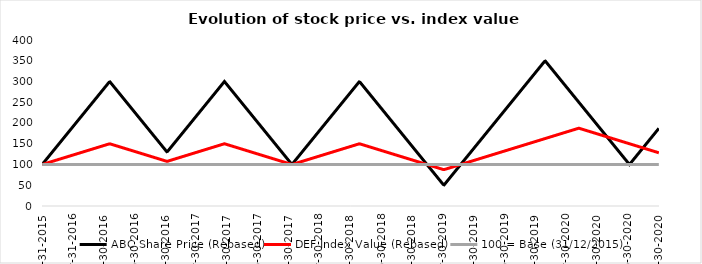
| Category | ABC Share Price (Rebased) | DEF Index Value (Rebased) | 100 = Base (31/12/2015) |
|---|---|---|---|
| 2020-12-31 | 187 | 128.25 | 100 |
| 2020-12-30 | 186 | 128.5 | 100 |
| 2020-12-29 | 185 | 128.75 | 100 |
| 2020-12-28 | 184 | 129 | 100 |
| 2020-12-27 | 183 | 129.25 | 100 |
| 2020-12-26 | 182 | 129.5 | 100 |
| 2020-12-25 | 181 | 129.75 | 100 |
| 2020-12-24 | 180 | 130 | 100 |
| 2020-12-23 | 179 | 130.25 | 100 |
| 2020-12-22 | 178 | 130.5 | 100 |
| 2020-12-21 | 177 | 130.75 | 100 |
| 2020-12-20 | 176 | 131 | 100 |
| 2020-12-19 | 175 | 131.25 | 100 |
| 2020-12-18 | 174 | 131.5 | 100 |
| 2020-12-17 | 173 | 131.75 | 100 |
| 2020-12-16 | 172 | 132 | 100 |
| 2020-12-15 | 171 | 132.25 | 100 |
| 2020-12-14 | 170 | 132.5 | 100 |
| 2020-12-13 | 169 | 132.75 | 100 |
| 2020-12-12 | 168 | 133 | 100 |
| 2020-12-11 | 167 | 133.25 | 100 |
| 2020-12-10 | 166 | 133.5 | 100 |
| 2020-12-09 | 165 | 133.75 | 100 |
| 2020-12-08 | 164 | 134 | 100 |
| 2020-12-07 | 163 | 134.25 | 100 |
| 2020-12-06 | 162 | 134.5 | 100 |
| 2020-12-05 | 161 | 134.75 | 100 |
| 2020-12-04 | 160 | 135 | 100 |
| 2020-12-03 | 159 | 135.25 | 100 |
| 2020-12-02 | 158 | 135.5 | 100 |
| 2020-12-01 | 157 | 135.75 | 100 |
| 2020-11-30 | 156 | 136 | 100 |
| 2020-11-29 | 155 | 136.25 | 100 |
| 2020-11-28 | 154 | 136.5 | 100 |
| 2020-11-27 | 153 | 136.75 | 100 |
| 2020-11-26 | 152 | 137 | 100 |
| 2020-11-25 | 151 | 137.25 | 100 |
| 2020-11-24 | 150 | 137.5 | 100 |
| 2020-11-23 | 149 | 137.75 | 100 |
| 2020-11-22 | 148 | 138 | 100 |
| 2020-11-21 | 147 | 138.25 | 100 |
| 2020-11-20 | 146 | 138.5 | 100 |
| 2020-11-19 | 145 | 138.75 | 100 |
| 2020-11-18 | 144 | 139 | 100 |
| 2020-11-17 | 143 | 139.25 | 100 |
| 2020-11-16 | 142 | 139.5 | 100 |
| 2020-11-15 | 141 | 139.75 | 100 |
| 2020-11-14 | 140 | 140 | 100 |
| 2020-11-13 | 139 | 140.25 | 100 |
| 2020-11-12 | 138 | 140.5 | 100 |
| 2020-11-11 | 137 | 140.75 | 100 |
| 2020-11-10 | 136 | 141 | 100 |
| 2020-11-09 | 135 | 141.25 | 100 |
| 2020-11-08 | 134 | 141.5 | 100 |
| 2020-11-07 | 133 | 141.75 | 100 |
| 2020-11-06 | 132 | 142 | 100 |
| 2020-11-05 | 131 | 142.25 | 100 |
| 2020-11-04 | 130 | 142.5 | 100 |
| 2020-11-03 | 129 | 142.75 | 100 |
| 2020-11-02 | 128 | 143 | 100 |
| 2020-11-01 | 127 | 143.25 | 100 |
| 2020-10-31 | 126 | 143.5 | 100 |
| 2020-10-30 | 125 | 143.75 | 100 |
| 2020-10-29 | 124 | 144 | 100 |
| 2020-10-28 | 123 | 144.25 | 100 |
| 2020-10-27 | 122 | 144.5 | 100 |
| 2020-10-26 | 121 | 144.75 | 100 |
| 2020-10-25 | 120 | 145 | 100 |
| 2020-10-24 | 119 | 145.25 | 100 |
| 2020-10-23 | 118 | 145.5 | 100 |
| 2020-10-22 | 117 | 145.75 | 100 |
| 2020-10-21 | 116 | 146 | 100 |
| 2020-10-20 | 115 | 146.25 | 100 |
| 2020-10-19 | 114 | 146.5 | 100 |
| 2020-10-18 | 113 | 146.75 | 100 |
| 2020-10-17 | 112 | 147 | 100 |
| 2020-10-16 | 111 | 147.25 | 100 |
| 2020-10-15 | 110 | 147.5 | 100 |
| 2020-10-14 | 109 | 147.75 | 100 |
| 2020-10-13 | 108 | 148 | 100 |
| 2020-10-12 | 107 | 148.25 | 100 |
| 2020-10-11 | 106 | 148.5 | 100 |
| 2020-10-10 | 105 | 148.75 | 100 |
| 2020-10-09 | 104 | 149 | 100 |
| 2020-10-08 | 103 | 149.25 | 100 |
| 2020-10-07 | 102 | 149.5 | 100 |
| 2020-10-06 | 101 | 149.75 | 100 |
| 2020-10-05 | 100 | 150 | 100 |
| 2020-10-04 | 101 | 150.25 | 100 |
| 2020-10-03 | 102 | 150.5 | 100 |
| 2020-10-02 | 103 | 150.75 | 100 |
| 2020-10-01 | 104 | 151 | 100 |
| 2020-09-30 | 105 | 151.25 | 100 |
| 2020-09-29 | 106 | 151.5 | 100 |
| 2020-09-28 | 107 | 151.75 | 100 |
| 2020-09-27 | 108 | 152 | 100 |
| 2020-09-26 | 109 | 152.25 | 100 |
| 2020-09-25 | 110 | 152.5 | 100 |
| 2020-09-24 | 111 | 152.75 | 100 |
| 2020-09-23 | 112 | 153 | 100 |
| 2020-09-22 | 113 | 153.25 | 100 |
| 2020-09-21 | 114 | 153.5 | 100 |
| 2020-09-20 | 115 | 153.75 | 100 |
| 2020-09-19 | 116 | 154 | 100 |
| 2020-09-18 | 117 | 154.25 | 100 |
| 2020-09-17 | 118 | 154.5 | 100 |
| 2020-09-16 | 119 | 154.75 | 100 |
| 2020-09-15 | 120 | 155 | 100 |
| 2020-09-14 | 121 | 155.25 | 100 |
| 2020-09-13 | 122 | 155.5 | 100 |
| 2020-09-12 | 123 | 155.75 | 100 |
| 2020-09-11 | 124 | 156 | 100 |
| 2020-09-10 | 125 | 156.25 | 100 |
| 2020-09-09 | 126 | 156.5 | 100 |
| 2020-09-08 | 127 | 156.75 | 100 |
| 2020-09-07 | 128 | 157 | 100 |
| 2020-09-06 | 129 | 157.25 | 100 |
| 2020-09-05 | 130 | 157.5 | 100 |
| 2020-09-04 | 131 | 157.75 | 100 |
| 2020-09-03 | 132 | 158 | 100 |
| 2020-09-02 | 133 | 158.25 | 100 |
| 2020-09-01 | 134 | 158.5 | 100 |
| 2020-08-31 | 135 | 158.75 | 100 |
| 2020-08-30 | 136 | 159 | 100 |
| 2020-08-29 | 137 | 159.25 | 100 |
| 2020-08-28 | 138 | 159.5 | 100 |
| 2020-08-27 | 139 | 159.75 | 100 |
| 2020-08-26 | 140 | 160 | 100 |
| 2020-08-25 | 141 | 160.25 | 100 |
| 2020-08-24 | 142 | 160.5 | 100 |
| 2020-08-23 | 143 | 160.75 | 100 |
| 2020-08-22 | 144 | 161 | 100 |
| 2020-08-21 | 145 | 161.25 | 100 |
| 2020-08-20 | 146 | 161.5 | 100 |
| 2020-08-19 | 147 | 161.75 | 100 |
| 2020-08-18 | 148 | 162 | 100 |
| 2020-08-17 | 149 | 162.25 | 100 |
| 2020-08-16 | 150 | 162.5 | 100 |
| 2020-08-15 | 151 | 162.75 | 100 |
| 2020-08-14 | 152 | 163 | 100 |
| 2020-08-13 | 153 | 163.25 | 100 |
| 2020-08-12 | 154 | 163.5 | 100 |
| 2020-08-11 | 155 | 163.75 | 100 |
| 2020-08-10 | 156 | 164 | 100 |
| 2020-08-09 | 157 | 164.25 | 100 |
| 2020-08-08 | 158 | 164.5 | 100 |
| 2020-08-07 | 159 | 164.75 | 100 |
| 2020-08-06 | 160 | 165 | 100 |
| 2020-08-05 | 161 | 165.25 | 100 |
| 2020-08-04 | 162 | 165.5 | 100 |
| 2020-08-03 | 163 | 165.75 | 100 |
| 2020-08-02 | 164 | 166 | 100 |
| 2020-08-01 | 165 | 166.25 | 100 |
| 2020-07-31 | 166 | 166.5 | 100 |
| 2020-07-30 | 167 | 166.75 | 100 |
| 2020-07-29 | 168 | 167 | 100 |
| 2020-07-28 | 169 | 167.25 | 100 |
| 2020-07-27 | 170 | 167.5 | 100 |
| 2020-07-26 | 171 | 167.75 | 100 |
| 2020-07-25 | 172 | 168 | 100 |
| 2020-07-24 | 173 | 168.25 | 100 |
| 2020-07-23 | 174 | 168.5 | 100 |
| 2020-07-22 | 175 | 168.75 | 100 |
| 2020-07-21 | 176 | 169 | 100 |
| 2020-07-20 | 177 | 169.25 | 100 |
| 2020-07-19 | 178 | 169.5 | 100 |
| 2020-07-18 | 179 | 169.75 | 100 |
| 2020-07-17 | 180 | 170 | 100 |
| 2020-07-16 | 181 | 170.25 | 100 |
| 2020-07-15 | 182 | 170.5 | 100 |
| 2020-07-14 | 183 | 170.75 | 100 |
| 2020-07-13 | 184 | 171 | 100 |
| 2020-07-12 | 185 | 171.25 | 100 |
| 2020-07-11 | 186 | 171.5 | 100 |
| 2020-07-10 | 187 | 171.75 | 100 |
| 2020-07-09 | 188 | 172 | 100 |
| 2020-07-08 | 189 | 172.25 | 100 |
| 2020-07-07 | 190 | 172.5 | 100 |
| 2020-07-06 | 191 | 172.75 | 100 |
| 2020-07-05 | 192 | 173 | 100 |
| 2020-07-04 | 193 | 173.25 | 100 |
| 2020-07-03 | 194 | 173.5 | 100 |
| 2020-07-02 | 195 | 173.75 | 100 |
| 2020-07-01 | 196 | 174 | 100 |
| 2020-06-30 | 197 | 174.25 | 100 |
| 2020-06-29 | 198 | 174.5 | 100 |
| 2020-06-28 | 199 | 174.75 | 100 |
| 2020-06-27 | 200 | 175 | 100 |
| 2020-06-26 | 201 | 175.25 | 100 |
| 2020-06-25 | 202 | 175.5 | 100 |
| 2020-06-24 | 203 | 175.75 | 100 |
| 2020-06-23 | 204 | 176 | 100 |
| 2020-06-22 | 205 | 176.25 | 100 |
| 2020-06-21 | 206 | 176.5 | 100 |
| 2020-06-20 | 207 | 176.75 | 100 |
| 2020-06-19 | 208 | 177 | 100 |
| 2020-06-18 | 209 | 177.25 | 100 |
| 2020-06-17 | 210 | 177.5 | 100 |
| 2020-06-16 | 211 | 177.75 | 100 |
| 2020-06-15 | 212 | 178 | 100 |
| 2020-06-14 | 213 | 178.25 | 100 |
| 2020-06-13 | 214 | 178.5 | 100 |
| 2020-06-12 | 215 | 178.75 | 100 |
| 2020-06-11 | 216 | 179 | 100 |
| 2020-06-10 | 217 | 179.25 | 100 |
| 2020-06-09 | 218 | 179.5 | 100 |
| 2020-06-08 | 219 | 179.75 | 100 |
| 2020-06-07 | 220 | 180 | 100 |
| 2020-06-06 | 221 | 180.25 | 100 |
| 2020-06-05 | 222 | 180.5 | 100 |
| 2020-06-04 | 223 | 180.75 | 100 |
| 2020-06-03 | 224 | 181 | 100 |
| 2020-06-02 | 225 | 181.25 | 100 |
| 2020-06-01 | 226 | 181.5 | 100 |
| 2020-05-31 | 227 | 181.75 | 100 |
| 2020-05-30 | 228 | 182 | 100 |
| 2020-05-29 | 229 | 182.25 | 100 |
| 2020-05-28 | 230 | 182.5 | 100 |
| 2020-05-27 | 231 | 182.75 | 100 |
| 2020-05-26 | 232 | 183 | 100 |
| 2020-05-25 | 233 | 183.25 | 100 |
| 2020-05-24 | 234 | 183.5 | 100 |
| 2020-05-23 | 235 | 183.75 | 100 |
| 2020-05-22 | 236 | 184 | 100 |
| 2020-05-21 | 237 | 184.25 | 100 |
| 2020-05-20 | 238 | 184.5 | 100 |
| 2020-05-19 | 239 | 184.75 | 100 |
| 2020-05-18 | 240 | 185 | 100 |
| 2020-05-17 | 241 | 185.25 | 100 |
| 2020-05-16 | 242 | 185.5 | 100 |
| 2020-05-15 | 243 | 185.75 | 100 |
| 2020-05-14 | 244 | 186 | 100 |
| 2020-05-13 | 245 | 186.25 | 100 |
| 2020-05-12 | 246 | 186.5 | 100 |
| 2020-05-11 | 247 | 186.75 | 100 |
| 2020-05-10 | 248 | 187 | 100 |
| 2020-05-09 | 249 | 187.25 | 100 |
| 2020-05-08 | 250 | 187.5 | 100 |
| 2020-05-07 | 251 | 187.25 | 100 |
| 2020-05-06 | 252 | 187 | 100 |
| 2020-05-05 | 253 | 186.75 | 100 |
| 2020-05-04 | 254 | 186.5 | 100 |
| 2020-05-03 | 255 | 186.25 | 100 |
| 2020-05-02 | 256 | 186 | 100 |
| 2020-05-01 | 257 | 185.75 | 100 |
| 2020-04-30 | 258 | 185.5 | 100 |
| 2020-04-29 | 259 | 185.25 | 100 |
| 2020-04-28 | 260 | 185 | 100 |
| 2020-04-27 | 261 | 184.75 | 100 |
| 2020-04-26 | 262 | 184.5 | 100 |
| 2020-04-25 | 263 | 184.25 | 100 |
| 2020-04-24 | 264 | 184 | 100 |
| 2020-04-23 | 265 | 183.75 | 100 |
| 2020-04-22 | 266 | 183.5 | 100 |
| 2020-04-21 | 267 | 183.25 | 100 |
| 2020-04-20 | 268 | 183 | 100 |
| 2020-04-19 | 269 | 182.75 | 100 |
| 2020-04-18 | 270 | 182.5 | 100 |
| 2020-04-17 | 271 | 182.25 | 100 |
| 2020-04-16 | 272 | 182 | 100 |
| 2020-04-15 | 273 | 181.75 | 100 |
| 2020-04-14 | 274 | 181.5 | 100 |
| 2020-04-13 | 275 | 181.25 | 100 |
| 2020-04-12 | 276 | 181 | 100 |
| 2020-04-11 | 277 | 180.75 | 100 |
| 2020-04-10 | 278 | 180.5 | 100 |
| 2020-04-09 | 279 | 180.25 | 100 |
| 2020-04-08 | 280 | 180 | 100 |
| 2020-04-07 | 281 | 179.75 | 100 |
| 2020-04-06 | 282 | 179.5 | 100 |
| 2020-04-05 | 283 | 179.25 | 100 |
| 2020-04-04 | 284 | 179 | 100 |
| 2020-04-03 | 285 | 178.75 | 100 |
| 2020-04-02 | 286 | 178.5 | 100 |
| 2020-04-01 | 287 | 178.25 | 100 |
| 2020-03-31 | 288 | 178 | 100 |
| 2020-03-30 | 289 | 177.75 | 100 |
| 2020-03-29 | 290 | 177.5 | 100 |
| 2020-03-28 | 291 | 177.25 | 100 |
| 2020-03-27 | 292 | 177 | 100 |
| 2020-03-26 | 293 | 176.75 | 100 |
| 2020-03-25 | 294 | 176.5 | 100 |
| 2020-03-24 | 295 | 176.25 | 100 |
| 2020-03-23 | 296 | 176 | 100 |
| 2020-03-22 | 297 | 175.75 | 100 |
| 2020-03-21 | 298 | 175.5 | 100 |
| 2020-03-20 | 299 | 175.25 | 100 |
| 2020-03-19 | 300 | 175 | 100 |
| 2020-03-18 | 301 | 174.75 | 100 |
| 2020-03-17 | 302 | 174.5 | 100 |
| 2020-03-16 | 303 | 174.25 | 100 |
| 2020-03-15 | 304 | 174 | 100 |
| 2020-03-14 | 305 | 173.75 | 100 |
| 2020-03-13 | 306 | 173.5 | 100 |
| 2020-03-12 | 307 | 173.25 | 100 |
| 2020-03-11 | 308 | 173 | 100 |
| 2020-03-10 | 309 | 172.75 | 100 |
| 2020-03-09 | 310 | 172.5 | 100 |
| 2020-03-08 | 311 | 172.25 | 100 |
| 2020-03-07 | 312 | 172 | 100 |
| 2020-03-06 | 313 | 171.75 | 100 |
| 2020-03-05 | 314 | 171.5 | 100 |
| 2020-03-04 | 315 | 171.25 | 100 |
| 2020-03-03 | 316 | 171 | 100 |
| 2020-03-02 | 317 | 170.75 | 100 |
| 2020-03-01 | 318 | 170.5 | 100 |
| 2020-02-29 | 319 | 170.25 | 100 |
| 2020-02-28 | 320 | 170 | 100 |
| 2020-02-27 | 321 | 169.75 | 100 |
| 2020-02-26 | 322 | 169.5 | 100 |
| 2020-02-25 | 323 | 169.25 | 100 |
| 2020-02-24 | 324 | 169 | 100 |
| 2020-02-23 | 325 | 168.75 | 100 |
| 2020-02-22 | 326 | 168.5 | 100 |
| 2020-02-21 | 327 | 168.25 | 100 |
| 2020-02-20 | 328 | 168 | 100 |
| 2020-02-19 | 329 | 167.75 | 100 |
| 2020-02-18 | 330 | 167.5 | 100 |
| 2020-02-17 | 331 | 167.25 | 100 |
| 2020-02-16 | 332 | 167 | 100 |
| 2020-02-15 | 333 | 166.75 | 100 |
| 2020-02-14 | 334 | 166.5 | 100 |
| 2020-02-13 | 335 | 166.25 | 100 |
| 2020-02-12 | 336 | 166 | 100 |
| 2020-02-11 | 337 | 165.75 | 100 |
| 2020-02-10 | 338 | 165.5 | 100 |
| 2020-02-09 | 339 | 165.25 | 100 |
| 2020-02-08 | 340 | 165 | 100 |
| 2020-02-07 | 341 | 164.75 | 100 |
| 2020-02-06 | 342 | 164.5 | 100 |
| 2020-02-05 | 343 | 164.25 | 100 |
| 2020-02-04 | 344 | 164 | 100 |
| 2020-02-03 | 345 | 163.75 | 100 |
| 2020-02-02 | 346 | 163.5 | 100 |
| 2020-02-01 | 347 | 163.25 | 100 |
| 2020-01-31 | 348 | 163 | 100 |
| 2020-01-30 | 349 | 162.75 | 100 |
| 2020-01-29 | 350 | 162.5 | 100 |
| 2020-01-28 | 349 | 162.25 | 100 |
| 2020-01-27 | 348 | 162 | 100 |
| 2020-01-26 | 347 | 161.75 | 100 |
| 2020-01-25 | 346 | 161.5 | 100 |
| 2020-01-24 | 345 | 161.25 | 100 |
| 2020-01-23 | 344 | 161 | 100 |
| 2020-01-22 | 343 | 160.75 | 100 |
| 2020-01-21 | 342 | 160.5 | 100 |
| 2020-01-20 | 341 | 160.25 | 100 |
| 2020-01-19 | 340 | 160 | 100 |
| 2020-01-18 | 339 | 159.75 | 100 |
| 2020-01-17 | 338 | 159.5 | 100 |
| 2020-01-16 | 337 | 159.25 | 100 |
| 2020-01-15 | 336 | 159 | 100 |
| 2020-01-14 | 335 | 158.75 | 100 |
| 2020-01-13 | 334 | 158.5 | 100 |
| 2020-01-12 | 333 | 158.25 | 100 |
| 2020-01-11 | 332 | 158 | 100 |
| 2020-01-10 | 331 | 157.75 | 100 |
| 2020-01-09 | 330 | 157.5 | 100 |
| 2020-01-08 | 329 | 157.25 | 100 |
| 2020-01-07 | 328 | 157 | 100 |
| 2020-01-06 | 327 | 156.75 | 100 |
| 2020-01-05 | 326 | 156.5 | 100 |
| 2020-01-04 | 325 | 156.25 | 100 |
| 2020-01-03 | 324 | 156 | 100 |
| 2020-01-02 | 323 | 155.75 | 100 |
| 2020-01-01 | 322 | 155.5 | 100 |
| 2019-12-31 | 321 | 155.25 | 100 |
| 2019-12-30 | 320 | 155 | 100 |
| 2019-12-29 | 319 | 154.75 | 100 |
| 2019-12-28 | 318 | 154.5 | 100 |
| 2019-12-27 | 317 | 154.25 | 100 |
| 2019-12-26 | 316 | 154 | 100 |
| 2019-12-25 | 315 | 153.75 | 100 |
| 2019-12-24 | 314 | 153.5 | 100 |
| 2019-12-23 | 313 | 153.25 | 100 |
| 2019-12-22 | 312 | 153 | 100 |
| 2019-12-21 | 311 | 152.75 | 100 |
| 2019-12-20 | 310 | 152.5 | 100 |
| 2019-12-19 | 309 | 152.25 | 100 |
| 2019-12-18 | 308 | 152 | 100 |
| 2019-12-17 | 307 | 151.75 | 100 |
| 2019-12-16 | 306 | 151.5 | 100 |
| 2019-12-15 | 305 | 151.25 | 100 |
| 2019-12-14 | 304 | 151 | 100 |
| 2019-12-13 | 303 | 150.75 | 100 |
| 2019-12-12 | 302 | 150.5 | 100 |
| 2019-12-11 | 301 | 150.25 | 100 |
| 2019-12-10 | 300 | 150 | 100 |
| 2019-12-09 | 299 | 149.75 | 100 |
| 2019-12-08 | 298 | 149.5 | 100 |
| 2019-12-07 | 297 | 149.25 | 100 |
| 2019-12-06 | 296 | 149 | 100 |
| 2019-12-05 | 295 | 148.75 | 100 |
| 2019-12-04 | 294 | 148.5 | 100 |
| 2019-12-03 | 293 | 148.25 | 100 |
| 2019-12-02 | 292 | 148 | 100 |
| 2019-12-01 | 291 | 147.75 | 100 |
| 2019-11-30 | 290 | 147.5 | 100 |
| 2019-11-29 | 289 | 147.25 | 100 |
| 2019-11-28 | 288 | 147 | 100 |
| 2019-11-27 | 287 | 146.75 | 100 |
| 2019-11-26 | 286 | 146.5 | 100 |
| 2019-11-25 | 285 | 146.25 | 100 |
| 2019-11-24 | 284 | 146 | 100 |
| 2019-11-23 | 283 | 145.75 | 100 |
| 2019-11-22 | 282 | 145.5 | 100 |
| 2019-11-21 | 281 | 145.25 | 100 |
| 2019-11-20 | 280 | 145 | 100 |
| 2019-11-19 | 279 | 144.75 | 100 |
| 2019-11-18 | 278 | 144.5 | 100 |
| 2019-11-17 | 277 | 144.25 | 100 |
| 2019-11-16 | 276 | 144 | 100 |
| 2019-11-15 | 275 | 143.75 | 100 |
| 2019-11-14 | 274 | 143.5 | 100 |
| 2019-11-13 | 273 | 143.25 | 100 |
| 2019-11-12 | 272 | 143 | 100 |
| 2019-11-11 | 271 | 142.75 | 100 |
| 2019-11-10 | 270 | 142.5 | 100 |
| 2019-11-09 | 269 | 142.25 | 100 |
| 2019-11-08 | 268 | 142 | 100 |
| 2019-11-07 | 267 | 141.75 | 100 |
| 2019-11-06 | 266 | 141.5 | 100 |
| 2019-11-05 | 265 | 141.25 | 100 |
| 2019-11-04 | 264 | 141 | 100 |
| 2019-11-03 | 263 | 140.75 | 100 |
| 2019-11-02 | 262 | 140.5 | 100 |
| 2019-11-01 | 261 | 140.25 | 100 |
| 2019-10-31 | 260 | 140 | 100 |
| 2019-10-30 | 259 | 139.75 | 100 |
| 2019-10-29 | 258 | 139.5 | 100 |
| 2019-10-28 | 257 | 139.25 | 100 |
| 2019-10-27 | 256 | 139 | 100 |
| 2019-10-26 | 255 | 138.75 | 100 |
| 2019-10-25 | 254 | 138.5 | 100 |
| 2019-10-24 | 253 | 138.25 | 100 |
| 2019-10-23 | 252 | 138 | 100 |
| 2019-10-22 | 251 | 137.75 | 100 |
| 2019-10-21 | 250 | 137.5 | 100 |
| 2019-10-20 | 249 | 137.25 | 100 |
| 2019-10-19 | 248 | 137 | 100 |
| 2019-10-18 | 247 | 136.75 | 100 |
| 2019-10-17 | 246 | 136.5 | 100 |
| 2019-10-16 | 245 | 136.25 | 100 |
| 2019-10-15 | 244 | 136 | 100 |
| 2019-10-14 | 243 | 135.75 | 100 |
| 2019-10-13 | 242 | 135.5 | 100 |
| 2019-10-12 | 241 | 135.25 | 100 |
| 2019-10-11 | 240 | 135 | 100 |
| 2019-10-10 | 239 | 134.75 | 100 |
| 2019-10-09 | 238 | 134.5 | 100 |
| 2019-10-08 | 237 | 134.25 | 100 |
| 2019-10-07 | 236 | 134 | 100 |
| 2019-10-06 | 235 | 133.75 | 100 |
| 2019-10-05 | 234 | 133.5 | 100 |
| 2019-10-04 | 233 | 133.25 | 100 |
| 2019-10-03 | 232 | 133 | 100 |
| 2019-10-02 | 231 | 132.75 | 100 |
| 2019-10-01 | 230 | 132.5 | 100 |
| 2019-09-30 | 229 | 132.25 | 100 |
| 2019-09-29 | 228 | 132 | 100 |
| 2019-09-28 | 227 | 131.75 | 100 |
| 2019-09-27 | 226 | 131.5 | 100 |
| 2019-09-26 | 225 | 131.25 | 100 |
| 2019-09-25 | 224 | 131 | 100 |
| 2019-09-24 | 223 | 130.75 | 100 |
| 2019-09-23 | 222 | 130.5 | 100 |
| 2019-09-22 | 221 | 130.25 | 100 |
| 2019-09-21 | 220 | 130 | 100 |
| 2019-09-20 | 219 | 129.75 | 100 |
| 2019-09-19 | 218 | 129.5 | 100 |
| 2019-09-18 | 217 | 129.25 | 100 |
| 2019-09-17 | 216 | 129 | 100 |
| 2019-09-16 | 215 | 128.75 | 100 |
| 2019-09-15 | 214 | 128.5 | 100 |
| 2019-09-14 | 213 | 128.25 | 100 |
| 2019-09-13 | 212 | 128 | 100 |
| 2019-09-12 | 211 | 127.75 | 100 |
| 2019-09-11 | 210 | 127.5 | 100 |
| 2019-09-10 | 209 | 127.25 | 100 |
| 2019-09-09 | 208 | 127 | 100 |
| 2019-09-08 | 207 | 126.75 | 100 |
| 2019-09-07 | 206 | 126.5 | 100 |
| 2019-09-06 | 205 | 126.25 | 100 |
| 2019-09-05 | 204 | 126 | 100 |
| 2019-09-04 | 203 | 125.75 | 100 |
| 2019-09-03 | 202 | 125.5 | 100 |
| 2019-09-02 | 201 | 125.25 | 100 |
| 2019-09-01 | 200 | 125 | 100 |
| 2019-08-31 | 199 | 124.75 | 100 |
| 2019-08-30 | 198 | 124.5 | 100 |
| 2019-08-29 | 197 | 124.25 | 100 |
| 2019-08-28 | 196 | 124 | 100 |
| 2019-08-27 | 195 | 123.75 | 100 |
| 2019-08-26 | 194 | 123.5 | 100 |
| 2019-08-25 | 193 | 123.25 | 100 |
| 2019-08-24 | 192 | 123 | 100 |
| 2019-08-23 | 191 | 122.75 | 100 |
| 2019-08-22 | 190 | 122.5 | 100 |
| 2019-08-21 | 189 | 122.25 | 100 |
| 2019-08-20 | 188 | 122 | 100 |
| 2019-08-19 | 187 | 121.75 | 100 |
| 2019-08-18 | 186 | 121.5 | 100 |
| 2019-08-17 | 185 | 121.25 | 100 |
| 2019-08-16 | 184 | 121 | 100 |
| 2019-08-15 | 183 | 120.75 | 100 |
| 2019-08-14 | 182 | 120.5 | 100 |
| 2019-08-13 | 181 | 120.25 | 100 |
| 2019-08-12 | 180 | 120 | 100 |
| 2019-08-11 | 179 | 119.75 | 100 |
| 2019-08-10 | 178 | 119.5 | 100 |
| 2019-08-09 | 177 | 119.25 | 100 |
| 2019-08-08 | 176 | 119 | 100 |
| 2019-08-07 | 175 | 118.75 | 100 |
| 2019-08-06 | 174 | 118.5 | 100 |
| 2019-08-05 | 173 | 118.25 | 100 |
| 2019-08-04 | 172 | 118 | 100 |
| 2019-08-03 | 171 | 117.75 | 100 |
| 2019-08-02 | 170 | 117.5 | 100 |
| 2019-08-01 | 169 | 117.25 | 100 |
| 2019-07-31 | 168 | 117 | 100 |
| 2019-07-30 | 167 | 116.75 | 100 |
| 2019-07-29 | 166 | 116.5 | 100 |
| 2019-07-28 | 165 | 116.25 | 100 |
| 2019-07-27 | 164 | 116 | 100 |
| 2019-07-26 | 163 | 115.75 | 100 |
| 2019-07-25 | 162 | 115.5 | 100 |
| 2019-07-24 | 161 | 115.25 | 100 |
| 2019-07-23 | 160 | 115 | 100 |
| 2019-07-22 | 159 | 114.75 | 100 |
| 2019-07-21 | 158 | 114.5 | 100 |
| 2019-07-20 | 157 | 114.25 | 100 |
| 2019-07-19 | 156 | 114 | 100 |
| 2019-07-18 | 155 | 113.75 | 100 |
| 2019-07-17 | 154 | 113.5 | 100 |
| 2019-07-16 | 153 | 113.25 | 100 |
| 2019-07-15 | 152 | 113 | 100 |
| 2019-07-14 | 151 | 112.75 | 100 |
| 2019-07-13 | 150 | 112.5 | 100 |
| 2019-07-12 | 149 | 112.25 | 100 |
| 2019-07-11 | 148 | 112 | 100 |
| 2019-07-10 | 147 | 111.75 | 100 |
| 2019-07-09 | 146 | 111.5 | 100 |
| 2019-07-08 | 145 | 111.25 | 100 |
| 2019-07-07 | 144 | 111 | 100 |
| 2019-07-06 | 143 | 110.75 | 100 |
| 2019-07-05 | 142 | 110.5 | 100 |
| 2019-07-04 | 141 | 110.25 | 100 |
| 2019-07-03 | 140 | 110 | 100 |
| 2019-07-02 | 139 | 109.75 | 100 |
| 2019-07-01 | 138 | 109.5 | 100 |
| 2019-06-30 | 137 | 109.25 | 100 |
| 2019-06-29 | 136 | 109 | 100 |
| 2019-06-28 | 135 | 108.75 | 100 |
| 2019-06-27 | 134 | 108.5 | 100 |
| 2019-06-26 | 133 | 108.25 | 100 |
| 2019-06-25 | 132 | 108 | 100 |
| 2019-06-24 | 131 | 107.75 | 100 |
| 2019-06-23 | 130 | 107.5 | 100 |
| 2019-06-22 | 129 | 107.25 | 100 |
| 2019-06-21 | 128 | 107 | 100 |
| 2019-06-20 | 127 | 106.75 | 100 |
| 2019-06-19 | 126 | 106.5 | 100 |
| 2019-06-18 | 125 | 106.25 | 100 |
| 2019-06-17 | 124 | 106 | 100 |
| 2019-06-16 | 123 | 105.75 | 100 |
| 2019-06-15 | 122 | 105.5 | 100 |
| 2019-06-14 | 121 | 105.25 | 100 |
| 2019-06-13 | 120 | 105 | 100 |
| 2019-06-12 | 119 | 104.75 | 100 |
| 2019-06-11 | 118 | 104.5 | 100 |
| 2019-06-10 | 117 | 104.25 | 100 |
| 2019-06-09 | 116 | 104 | 100 |
| 2019-06-08 | 115 | 103.75 | 100 |
| 2019-06-07 | 114 | 103.5 | 100 |
| 2019-06-06 | 113 | 103.25 | 100 |
| 2019-06-05 | 112 | 103 | 100 |
| 2019-06-04 | 111 | 102.75 | 100 |
| 2019-06-03 | 110 | 102.5 | 100 |
| 2019-06-02 | 109 | 102.25 | 100 |
| 2019-06-01 | 108 | 102 | 100 |
| 2019-05-31 | 107 | 101.75 | 100 |
| 2019-05-30 | 106 | 101.5 | 100 |
| 2019-05-29 | 105 | 101.25 | 100 |
| 2019-05-28 | 104 | 101 | 100 |
| 2019-05-27 | 103 | 100.75 | 100 |
| 2019-05-26 | 102 | 100.5 | 100 |
| 2019-05-25 | 101 | 100.25 | 100 |
| 2019-05-24 | 100 | 100 | 100 |
| 2019-05-23 | 99 | 99.75 | 100 |
| 2019-05-22 | 98 | 99.5 | 100 |
| 2019-05-21 | 97 | 99.25 | 100 |
| 2019-05-20 | 96 | 99 | 100 |
| 2019-05-19 | 95 | 98.75 | 100 |
| 2019-05-18 | 94 | 98.5 | 100 |
| 2019-05-17 | 93 | 98.25 | 100 |
| 2019-05-16 | 92 | 98 | 100 |
| 2019-05-15 | 91 | 97.75 | 100 |
| 2019-05-14 | 90 | 97.5 | 100 |
| 2019-05-13 | 89 | 97.25 | 100 |
| 2019-05-12 | 88 | 97 | 100 |
| 2019-05-11 | 87 | 96.75 | 100 |
| 2019-05-10 | 86 | 96.5 | 100 |
| 2019-05-09 | 85 | 96.25 | 100 |
| 2019-05-08 | 84 | 96 | 100 |
| 2019-05-07 | 83 | 95.75 | 100 |
| 2019-05-06 | 82 | 95.5 | 100 |
| 2019-05-05 | 81 | 95.25 | 100 |
| 2019-05-04 | 80 | 95 | 100 |
| 2019-05-03 | 79 | 94.75 | 100 |
| 2019-05-02 | 78 | 94.5 | 100 |
| 2019-05-01 | 77 | 94.25 | 100 |
| 2019-04-30 | 76 | 94 | 100 |
| 2019-04-29 | 75 | 93.75 | 100 |
| 2019-04-28 | 74 | 93.5 | 100 |
| 2019-04-27 | 73 | 93.25 | 100 |
| 2019-04-26 | 72 | 93 | 100 |
| 2019-04-25 | 71 | 92.75 | 100 |
| 2019-04-24 | 70 | 92.5 | 100 |
| 2019-04-23 | 69 | 92.25 | 100 |
| 2019-04-22 | 68 | 92 | 100 |
| 2019-04-21 | 67 | 91.75 | 100 |
| 2019-04-20 | 66 | 91.5 | 100 |
| 2019-04-19 | 65 | 91.25 | 100 |
| 2019-04-18 | 64 | 91 | 100 |
| 2019-04-17 | 63 | 90.75 | 100 |
| 2019-04-16 | 62 | 90.5 | 100 |
| 2019-04-15 | 61 | 90.25 | 100 |
| 2019-04-14 | 60 | 90 | 100 |
| 2019-04-13 | 59 | 89.75 | 100 |
| 2019-04-12 | 58 | 89.5 | 100 |
| 2019-04-11 | 57 | 89.25 | 100 |
| 2019-04-10 | 56 | 89 | 100 |
| 2019-04-09 | 55 | 88.75 | 100 |
| 2019-04-08 | 54 | 88.5 | 100 |
| 2019-04-07 | 53 | 88.25 | 100 |
| 2019-04-06 | 52 | 88 | 100 |
| 2019-04-05 | 51 | 87.75 | 100 |
| 2019-04-04 | 50 | 87.5 | 100 |
| 2019-04-03 | 51 | 87.75 | 100 |
| 2019-04-02 | 52 | 88 | 100 |
| 2019-04-01 | 53 | 88.25 | 100 |
| 2019-03-31 | 54 | 88.5 | 100 |
| 2019-03-30 | 55 | 88.75 | 100 |
| 2019-03-29 | 56 | 89 | 100 |
| 2019-03-28 | 57 | 89.25 | 100 |
| 2019-03-27 | 58 | 89.5 | 100 |
| 2019-03-26 | 59 | 89.75 | 100 |
| 2019-03-25 | 60 | 90 | 100 |
| 2019-03-24 | 61 | 90.25 | 100 |
| 2019-03-23 | 62 | 90.5 | 100 |
| 2019-03-22 | 63 | 90.75 | 100 |
| 2019-03-21 | 64 | 91 | 100 |
| 2019-03-20 | 65 | 91.25 | 100 |
| 2019-03-19 | 66 | 91.5 | 100 |
| 2019-03-18 | 67 | 91.75 | 100 |
| 2019-03-17 | 68 | 92 | 100 |
| 2019-03-16 | 69 | 92.25 | 100 |
| 2019-03-15 | 70 | 92.5 | 100 |
| 2019-03-14 | 71 | 92.75 | 100 |
| 2019-03-13 | 72 | 93 | 100 |
| 2019-03-12 | 73 | 93.25 | 100 |
| 2019-03-11 | 74 | 93.5 | 100 |
| 2019-03-10 | 75 | 93.75 | 100 |
| 2019-03-09 | 76 | 94 | 100 |
| 2019-03-08 | 77 | 94.25 | 100 |
| 2019-03-07 | 78 | 94.5 | 100 |
| 2019-03-06 | 79 | 94.75 | 100 |
| 2019-03-05 | 80 | 95 | 100 |
| 2019-03-04 | 81 | 95.25 | 100 |
| 2019-03-03 | 82 | 95.5 | 100 |
| 2019-03-02 | 83 | 95.75 | 100 |
| 2019-03-01 | 84 | 96 | 100 |
| 2019-02-28 | 85 | 96.25 | 100 |
| 2019-02-27 | 86 | 96.5 | 100 |
| 2019-02-26 | 87 | 96.75 | 100 |
| 2019-02-25 | 88 | 97 | 100 |
| 2019-02-24 | 89 | 97.25 | 100 |
| 2019-02-23 | 90 | 97.5 | 100 |
| 2019-02-22 | 91 | 97.75 | 100 |
| 2019-02-21 | 92 | 98 | 100 |
| 2019-02-20 | 93 | 98.25 | 100 |
| 2019-02-19 | 94 | 98.5 | 100 |
| 2019-02-18 | 95 | 98.75 | 100 |
| 2019-02-17 | 96 | 99 | 100 |
| 2019-02-16 | 97 | 99.25 | 100 |
| 2019-02-15 | 98 | 99.5 | 100 |
| 2019-02-14 | 99 | 99.75 | 100 |
| 2019-02-13 | 100 | 100 | 100 |
| 2019-02-12 | 101 | 100.25 | 100 |
| 2019-02-11 | 102 | 100.5 | 100 |
| 2019-02-10 | 103 | 100.75 | 100 |
| 2019-02-09 | 104 | 101 | 100 |
| 2019-02-08 | 105 | 101.25 | 100 |
| 2019-02-07 | 106 | 101.5 | 100 |
| 2019-02-06 | 107 | 101.75 | 100 |
| 2019-02-05 | 108 | 102 | 100 |
| 2019-02-04 | 109 | 102.25 | 100 |
| 2019-02-03 | 110 | 102.5 | 100 |
| 2019-02-02 | 111 | 102.75 | 100 |
| 2019-02-01 | 112 | 103 | 100 |
| 2019-01-31 | 113 | 103.25 | 100 |
| 2019-01-30 | 114 | 103.5 | 100 |
| 2019-01-29 | 115 | 103.75 | 100 |
| 2019-01-28 | 116 | 104 | 100 |
| 2019-01-27 | 117 | 104.25 | 100 |
| 2019-01-26 | 118 | 104.5 | 100 |
| 2019-01-25 | 119 | 104.75 | 100 |
| 2019-01-24 | 120 | 105 | 100 |
| 2019-01-23 | 121 | 105.25 | 100 |
| 2019-01-22 | 122 | 105.5 | 100 |
| 2019-01-21 | 123 | 105.75 | 100 |
| 2019-01-20 | 124 | 106 | 100 |
| 2019-01-19 | 125 | 106.25 | 100 |
| 2019-01-18 | 126 | 106.5 | 100 |
| 2019-01-17 | 127 | 106.75 | 100 |
| 2019-01-16 | 128 | 107 | 100 |
| 2019-01-15 | 129 | 107.25 | 100 |
| 2019-01-14 | 130 | 107.5 | 100 |
| 2019-01-13 | 131 | 107.75 | 100 |
| 2019-01-12 | 132 | 108 | 100 |
| 2019-01-11 | 133 | 108.25 | 100 |
| 2019-01-10 | 134 | 108.5 | 100 |
| 2019-01-09 | 135 | 108.75 | 100 |
| 2019-01-08 | 136 | 109 | 100 |
| 2019-01-07 | 137 | 109.25 | 100 |
| 2019-01-06 | 138 | 109.5 | 100 |
| 2019-01-05 | 139 | 109.75 | 100 |
| 2019-01-04 | 140 | 110 | 100 |
| 2019-01-03 | 141 | 110.25 | 100 |
| 2019-01-02 | 142 | 110.5 | 100 |
| 2019-01-01 | 143 | 110.75 | 100 |
| 2018-12-31 | 144 | 111 | 100 |
| 2018-12-30 | 145 | 111.25 | 100 |
| 2018-12-29 | 146 | 111.5 | 100 |
| 2018-12-28 | 147 | 111.75 | 100 |
| 2018-12-27 | 148 | 112 | 100 |
| 2018-12-26 | 149 | 112.25 | 100 |
| 2018-12-25 | 150 | 112.5 | 100 |
| 2018-12-24 | 151 | 112.75 | 100 |
| 2018-12-23 | 152 | 113 | 100 |
| 2018-12-22 | 153 | 113.25 | 100 |
| 2018-12-21 | 154 | 113.5 | 100 |
| 2018-12-20 | 155 | 113.75 | 100 |
| 2018-12-19 | 156 | 114 | 100 |
| 2018-12-18 | 157 | 114.25 | 100 |
| 2018-12-17 | 158 | 114.5 | 100 |
| 2018-12-16 | 159 | 114.75 | 100 |
| 2018-12-15 | 160 | 115 | 100 |
| 2018-12-14 | 161 | 115.25 | 100 |
| 2018-12-13 | 162 | 115.5 | 100 |
| 2018-12-12 | 163 | 115.75 | 100 |
| 2018-12-11 | 164 | 116 | 100 |
| 2018-12-10 | 165 | 116.25 | 100 |
| 2018-12-09 | 166 | 116.5 | 100 |
| 2018-12-08 | 167 | 116.75 | 100 |
| 2018-12-07 | 168 | 117 | 100 |
| 2018-12-06 | 169 | 117.25 | 100 |
| 2018-12-05 | 170 | 117.5 | 100 |
| 2018-12-04 | 171 | 117.75 | 100 |
| 2018-12-03 | 172 | 118 | 100 |
| 2018-12-02 | 173 | 118.25 | 100 |
| 2018-12-01 | 174 | 118.5 | 100 |
| 2018-11-30 | 175 | 118.75 | 100 |
| 2018-11-29 | 176 | 119 | 100 |
| 2018-11-28 | 177 | 119.25 | 100 |
| 2018-11-27 | 178 | 119.5 | 100 |
| 2018-11-26 | 179 | 119.75 | 100 |
| 2018-11-25 | 180 | 120 | 100 |
| 2018-11-24 | 181 | 120.25 | 100 |
| 2018-11-23 | 182 | 120.5 | 100 |
| 2018-11-22 | 183 | 120.75 | 100 |
| 2018-11-21 | 184 | 121 | 100 |
| 2018-11-20 | 185 | 121.25 | 100 |
| 2018-11-19 | 186 | 121.5 | 100 |
| 2018-11-18 | 187 | 121.75 | 100 |
| 2018-11-17 | 188 | 122 | 100 |
| 2018-11-16 | 189 | 122.25 | 100 |
| 2018-11-15 | 190 | 122.5 | 100 |
| 2018-11-14 | 191 | 122.75 | 100 |
| 2018-11-13 | 192 | 123 | 100 |
| 2018-11-12 | 193 | 123.25 | 100 |
| 2018-11-11 | 194 | 123.5 | 100 |
| 2018-11-10 | 195 | 123.75 | 100 |
| 2018-11-09 | 196 | 124 | 100 |
| 2018-11-08 | 197 | 124.25 | 100 |
| 2018-11-07 | 198 | 124.5 | 100 |
| 2018-11-06 | 199 | 124.75 | 100 |
| 2018-11-05 | 200 | 125 | 100 |
| 2018-11-04 | 201 | 125.25 | 100 |
| 2018-11-03 | 202 | 125.5 | 100 |
| 2018-11-02 | 203 | 125.75 | 100 |
| 2018-11-01 | 204 | 126 | 100 |
| 2018-10-31 | 205 | 126.25 | 100 |
| 2018-10-30 | 206 | 126.5 | 100 |
| 2018-10-29 | 207 | 126.75 | 100 |
| 2018-10-28 | 208 | 127 | 100 |
| 2018-10-27 | 209 | 127.25 | 100 |
| 2018-10-26 | 210 | 127.5 | 100 |
| 2018-10-25 | 211 | 127.75 | 100 |
| 2018-10-24 | 212 | 128 | 100 |
| 2018-10-23 | 213 | 128.25 | 100 |
| 2018-10-22 | 214 | 128.5 | 100 |
| 2018-10-21 | 215 | 128.75 | 100 |
| 2018-10-20 | 216 | 129 | 100 |
| 2018-10-19 | 217 | 129.25 | 100 |
| 2018-10-18 | 218 | 129.5 | 100 |
| 2018-10-17 | 219 | 129.75 | 100 |
| 2018-10-16 | 220 | 130 | 100 |
| 2018-10-15 | 221 | 130.25 | 100 |
| 2018-10-14 | 222 | 130.5 | 100 |
| 2018-10-13 | 223 | 130.75 | 100 |
| 2018-10-12 | 224 | 131 | 100 |
| 2018-10-11 | 225 | 131.25 | 100 |
| 2018-10-10 | 226 | 131.5 | 100 |
| 2018-10-09 | 227 | 131.75 | 100 |
| 2018-10-08 | 228 | 132 | 100 |
| 2018-10-07 | 229 | 132.25 | 100 |
| 2018-10-06 | 230 | 132.5 | 100 |
| 2018-10-05 | 231 | 132.75 | 100 |
| 2018-10-04 | 232 | 133 | 100 |
| 2018-10-03 | 233 | 133.25 | 100 |
| 2018-10-02 | 234 | 133.5 | 100 |
| 2018-10-01 | 235 | 133.75 | 100 |
| 2018-09-30 | 236 | 134 | 100 |
| 2018-09-29 | 237 | 134.25 | 100 |
| 2018-09-28 | 238 | 134.5 | 100 |
| 2018-09-27 | 239 | 134.75 | 100 |
| 2018-09-26 | 240 | 135 | 100 |
| 2018-09-25 | 241 | 135.25 | 100 |
| 2018-09-24 | 242 | 135.5 | 100 |
| 2018-09-23 | 243 | 135.75 | 100 |
| 2018-09-22 | 244 | 136 | 100 |
| 2018-09-21 | 245 | 136.25 | 100 |
| 2018-09-20 | 246 | 136.5 | 100 |
| 2018-09-19 | 247 | 136.75 | 100 |
| 2018-09-18 | 248 | 137 | 100 |
| 2018-09-17 | 249 | 137.25 | 100 |
| 2018-09-16 | 250 | 137.5 | 100 |
| 2018-09-15 | 251 | 137.75 | 100 |
| 2018-09-14 | 252 | 138 | 100 |
| 2018-09-13 | 253 | 138.25 | 100 |
| 2018-09-12 | 254 | 138.5 | 100 |
| 2018-09-11 | 255 | 138.75 | 100 |
| 2018-09-10 | 256 | 139 | 100 |
| 2018-09-09 | 257 | 139.25 | 100 |
| 2018-09-08 | 258 | 139.5 | 100 |
| 2018-09-07 | 259 | 139.75 | 100 |
| 2018-09-06 | 260 | 140 | 100 |
| 2018-09-05 | 261 | 140.25 | 100 |
| 2018-09-04 | 262 | 140.5 | 100 |
| 2018-09-03 | 263 | 140.75 | 100 |
| 2018-09-02 | 264 | 141 | 100 |
| 2018-09-01 | 265 | 141.25 | 100 |
| 2018-08-31 | 266 | 141.5 | 100 |
| 2018-08-30 | 267 | 141.75 | 100 |
| 2018-08-29 | 268 | 142 | 100 |
| 2018-08-28 | 269 | 142.25 | 100 |
| 2018-08-27 | 270 | 142.5 | 100 |
| 2018-08-26 | 271 | 142.75 | 100 |
| 2018-08-25 | 272 | 143 | 100 |
| 2018-08-24 | 273 | 143.25 | 100 |
| 2018-08-23 | 274 | 143.5 | 100 |
| 2018-08-22 | 275 | 143.75 | 100 |
| 2018-08-21 | 276 | 144 | 100 |
| 2018-08-20 | 277 | 144.25 | 100 |
| 2018-08-19 | 278 | 144.5 | 100 |
| 2018-08-18 | 279 | 144.75 | 100 |
| 2018-08-17 | 280 | 145 | 100 |
| 2018-08-16 | 281 | 145.25 | 100 |
| 2018-08-15 | 282 | 145.5 | 100 |
| 2018-08-14 | 283 | 145.75 | 100 |
| 2018-08-13 | 284 | 146 | 100 |
| 2018-08-12 | 285 | 146.25 | 100 |
| 2018-08-11 | 286 | 146.5 | 100 |
| 2018-08-10 | 287 | 146.75 | 100 |
| 2018-08-09 | 288 | 147 | 100 |
| 2018-08-08 | 289 | 147.25 | 100 |
| 2018-08-07 | 290 | 147.5 | 100 |
| 2018-08-06 | 291 | 147.75 | 100 |
| 2018-08-05 | 292 | 148 | 100 |
| 2018-08-04 | 293 | 148.25 | 100 |
| 2018-08-03 | 294 | 148.5 | 100 |
| 2018-08-02 | 295 | 148.75 | 100 |
| 2018-08-01 | 296 | 149 | 100 |
| 2018-07-31 | 297 | 149.25 | 100 |
| 2018-07-30 | 298 | 149.5 | 100 |
| 2018-07-29 | 299 | 149.75 | 100 |
| 2018-07-28 | 300 | 150 | 100 |
| 2018-07-27 | 299 | 149.75 | 100 |
| 2018-07-26 | 298 | 149.5 | 100 |
| 2018-07-25 | 297 | 149.25 | 100 |
| 2018-07-24 | 296 | 149 | 100 |
| 2018-07-23 | 295 | 148.75 | 100 |
| 2018-07-22 | 294 | 148.5 | 100 |
| 2018-07-21 | 293 | 148.25 | 100 |
| 2018-07-20 | 292 | 148 | 100 |
| 2018-07-19 | 291 | 147.75 | 100 |
| 2018-07-18 | 290 | 147.5 | 100 |
| 2018-07-17 | 289 | 147.25 | 100 |
| 2018-07-16 | 288 | 147 | 100 |
| 2018-07-15 | 287 | 146.75 | 100 |
| 2018-07-14 | 286 | 146.5 | 100 |
| 2018-07-13 | 285 | 146.25 | 100 |
| 2018-07-12 | 284 | 146 | 100 |
| 2018-07-11 | 283 | 145.75 | 100 |
| 2018-07-10 | 282 | 145.5 | 100 |
| 2018-07-09 | 281 | 145.25 | 100 |
| 2018-07-08 | 280 | 145 | 100 |
| 2018-07-07 | 279 | 144.75 | 100 |
| 2018-07-06 | 278 | 144.5 | 100 |
| 2018-07-05 | 277 | 144.25 | 100 |
| 2018-07-04 | 276 | 144 | 100 |
| 2018-07-03 | 275 | 143.75 | 100 |
| 2018-07-02 | 274 | 143.5 | 100 |
| 2018-07-01 | 273 | 143.25 | 100 |
| 2018-06-30 | 272 | 143 | 100 |
| 2018-06-29 | 271 | 142.75 | 100 |
| 2018-06-28 | 270 | 142.5 | 100 |
| 2018-06-27 | 269 | 142.25 | 100 |
| 2018-06-26 | 268 | 142 | 100 |
| 2018-06-25 | 267 | 141.75 | 100 |
| 2018-06-24 | 266 | 141.5 | 100 |
| 2018-06-23 | 265 | 141.25 | 100 |
| 2018-06-22 | 264 | 141 | 100 |
| 2018-06-21 | 263 | 140.75 | 100 |
| 2018-06-20 | 262 | 140.5 | 100 |
| 2018-06-19 | 261 | 140.25 | 100 |
| 2018-06-18 | 260 | 140 | 100 |
| 2018-06-17 | 259 | 139.75 | 100 |
| 2018-06-16 | 258 | 139.5 | 100 |
| 2018-06-15 | 257 | 139.25 | 100 |
| 2018-06-14 | 256 | 139 | 100 |
| 2018-06-13 | 255 | 138.75 | 100 |
| 2018-06-12 | 254 | 138.5 | 100 |
| 2018-06-11 | 253 | 138.25 | 100 |
| 2018-06-10 | 252 | 138 | 100 |
| 2018-06-09 | 251 | 137.75 | 100 |
| 2018-06-08 | 250 | 137.5 | 100 |
| 2018-06-07 | 249 | 137.25 | 100 |
| 2018-06-06 | 248 | 137 | 100 |
| 2018-06-05 | 247 | 136.75 | 100 |
| 2018-06-04 | 246 | 136.5 | 100 |
| 2018-06-03 | 245 | 136.25 | 100 |
| 2018-06-02 | 244 | 136 | 100 |
| 2018-06-01 | 243 | 135.75 | 100 |
| 2018-05-31 | 242 | 135.5 | 100 |
| 2018-05-30 | 241 | 135.25 | 100 |
| 2018-05-29 | 240 | 135 | 100 |
| 2018-05-28 | 239 | 134.75 | 100 |
| 2018-05-27 | 238 | 134.5 | 100 |
| 2018-05-26 | 237 | 134.25 | 100 |
| 2018-05-25 | 236 | 134 | 100 |
| 2018-05-24 | 235 | 133.75 | 100 |
| 2018-05-23 | 234 | 133.5 | 100 |
| 2018-05-22 | 233 | 133.25 | 100 |
| 2018-05-21 | 232 | 133 | 100 |
| 2018-05-20 | 231 | 132.75 | 100 |
| 2018-05-19 | 230 | 132.5 | 100 |
| 2018-05-18 | 229 | 132.25 | 100 |
| 2018-05-17 | 228 | 132 | 100 |
| 2018-05-16 | 227 | 131.75 | 100 |
| 2018-05-15 | 226 | 131.5 | 100 |
| 2018-05-14 | 225 | 131.25 | 100 |
| 2018-05-13 | 224 | 131 | 100 |
| 2018-05-12 | 223 | 130.75 | 100 |
| 2018-05-11 | 222 | 130.5 | 100 |
| 2018-05-10 | 221 | 130.25 | 100 |
| 2018-05-09 | 220 | 130 | 100 |
| 2018-05-08 | 219 | 129.75 | 100 |
| 2018-05-07 | 218 | 129.5 | 100 |
| 2018-05-06 | 217 | 129.25 | 100 |
| 2018-05-05 | 216 | 129 | 100 |
| 2018-05-04 | 215 | 128.75 | 100 |
| 2018-05-03 | 214 | 128.5 | 100 |
| 2018-05-02 | 213 | 128.25 | 100 |
| 2018-05-01 | 212 | 128 | 100 |
| 2018-04-30 | 211 | 127.75 | 100 |
| 2018-04-29 | 210 | 127.5 | 100 |
| 2018-04-28 | 209 | 127.25 | 100 |
| 2018-04-27 | 208 | 127 | 100 |
| 2018-04-26 | 207 | 126.75 | 100 |
| 2018-04-25 | 206 | 126.5 | 100 |
| 2018-04-24 | 205 | 126.25 | 100 |
| 2018-04-23 | 204 | 126 | 100 |
| 2018-04-22 | 203 | 125.75 | 100 |
| 2018-04-21 | 202 | 125.5 | 100 |
| 2018-04-20 | 201 | 125.25 | 100 |
| 2018-04-19 | 200 | 125 | 100 |
| 2018-04-18 | 199 | 124.75 | 100 |
| 2018-04-17 | 198 | 124.5 | 100 |
| 2018-04-16 | 197 | 124.25 | 100 |
| 2018-04-15 | 196 | 124 | 100 |
| 2018-04-14 | 195 | 123.75 | 100 |
| 2018-04-13 | 194 | 123.5 | 100 |
| 2018-04-12 | 193 | 123.25 | 100 |
| 2018-04-11 | 192 | 123 | 100 |
| 2018-04-10 | 191 | 122.75 | 100 |
| 2018-04-09 | 190 | 122.5 | 100 |
| 2018-04-08 | 189 | 122.25 | 100 |
| 2018-04-07 | 188 | 122 | 100 |
| 2018-04-06 | 187 | 121.75 | 100 |
| 2018-04-05 | 186 | 121.5 | 100 |
| 2018-04-04 | 185 | 121.25 | 100 |
| 2018-04-03 | 184 | 121 | 100 |
| 2018-04-02 | 183 | 120.75 | 100 |
| 2018-04-01 | 182 | 120.5 | 100 |
| 2018-03-31 | 181 | 120.25 | 100 |
| 2018-03-30 | 180 | 120 | 100 |
| 2018-03-29 | 179 | 119.75 | 100 |
| 2018-03-28 | 178 | 119.5 | 100 |
| 2018-03-27 | 177 | 119.25 | 100 |
| 2018-03-26 | 176 | 119 | 100 |
| 2018-03-25 | 175 | 118.75 | 100 |
| 2018-03-24 | 174 | 118.5 | 100 |
| 2018-03-23 | 173 | 118.25 | 100 |
| 2018-03-22 | 172 | 118 | 100 |
| 2018-03-21 | 171 | 117.75 | 100 |
| 2018-03-20 | 170 | 117.5 | 100 |
| 2018-03-19 | 169 | 117.25 | 100 |
| 2018-03-18 | 168 | 117 | 100 |
| 2018-03-17 | 167 | 116.75 | 100 |
| 2018-03-16 | 166 | 116.5 | 100 |
| 2018-03-15 | 165 | 116.25 | 100 |
| 2018-03-14 | 164 | 116 | 100 |
| 2018-03-13 | 163 | 115.75 | 100 |
| 2018-03-12 | 162 | 115.5 | 100 |
| 2018-03-11 | 161 | 115.25 | 100 |
| 2018-03-10 | 160 | 115 | 100 |
| 2018-03-09 | 159 | 114.75 | 100 |
| 2018-03-08 | 158 | 114.5 | 100 |
| 2018-03-07 | 157 | 114.25 | 100 |
| 2018-03-06 | 156 | 114 | 100 |
| 2018-03-05 | 155 | 113.75 | 100 |
| 2018-03-04 | 154 | 113.5 | 100 |
| 2018-03-03 | 153 | 113.25 | 100 |
| 2018-03-02 | 152 | 113 | 100 |
| 2018-03-01 | 151 | 112.75 | 100 |
| 2018-02-28 | 150 | 112.5 | 100 |
| 2018-02-27 | 149 | 112.25 | 100 |
| 2018-02-26 | 148 | 112 | 100 |
| 2018-02-25 | 147 | 111.75 | 100 |
| 2018-02-24 | 146 | 111.5 | 100 |
| 2018-02-23 | 145 | 111.25 | 100 |
| 2018-02-22 | 144 | 111 | 100 |
| 2018-02-21 | 143 | 110.75 | 100 |
| 2018-02-20 | 142 | 110.5 | 100 |
| 2018-02-19 | 141 | 110.25 | 100 |
| 2018-02-18 | 140 | 110 | 100 |
| 2018-02-17 | 139 | 109.75 | 100 |
| 2018-02-16 | 138 | 109.5 | 100 |
| 2018-02-15 | 137 | 109.25 | 100 |
| 2018-02-14 | 136 | 109 | 100 |
| 2018-02-13 | 135 | 108.75 | 100 |
| 2018-02-12 | 134 | 108.5 | 100 |
| 2018-02-11 | 133 | 108.25 | 100 |
| 2018-02-10 | 132 | 108 | 100 |
| 2018-02-09 | 131 | 107.75 | 100 |
| 2018-02-08 | 130 | 107.5 | 100 |
| 2018-02-07 | 129 | 107.25 | 100 |
| 2018-02-06 | 128 | 107 | 100 |
| 2018-02-05 | 127 | 106.75 | 100 |
| 2018-02-04 | 126 | 106.5 | 100 |
| 2018-02-03 | 125 | 106.25 | 100 |
| 2018-02-02 | 124 | 106 | 100 |
| 2018-02-01 | 123 | 105.75 | 100 |
| 2018-01-31 | 122 | 105.5 | 100 |
| 2018-01-30 | 121 | 105.25 | 100 |
| 2018-01-29 | 120 | 105 | 100 |
| 2018-01-28 | 119 | 104.75 | 100 |
| 2018-01-27 | 118 | 104.5 | 100 |
| 2018-01-26 | 117 | 104.25 | 100 |
| 2018-01-25 | 116 | 104 | 100 |
| 2018-01-24 | 115 | 103.75 | 100 |
| 2018-01-23 | 114 | 103.5 | 100 |
| 2018-01-22 | 113 | 103.25 | 100 |
| 2018-01-21 | 112 | 103 | 100 |
| 2018-01-20 | 111 | 102.75 | 100 |
| 2018-01-19 | 110 | 102.5 | 100 |
| 2018-01-18 | 109 | 102.25 | 100 |
| 2018-01-17 | 108 | 102 | 100 |
| 2018-01-16 | 107 | 101.75 | 100 |
| 2018-01-15 | 106 | 101.5 | 100 |
| 2018-01-14 | 105 | 101.25 | 100 |
| 2018-01-13 | 104 | 101 | 100 |
| 2018-01-12 | 103 | 100.75 | 100 |
| 2018-01-11 | 102 | 100.5 | 100 |
| 2018-01-10 | 101 | 100.25 | 100 |
| 2018-01-09 | 100 | 100 | 100 |
| 2018-01-08 | 101 | 100.25 | 100 |
| 2018-01-07 | 102 | 100.5 | 100 |
| 2018-01-06 | 103 | 100.75 | 100 |
| 2018-01-05 | 104 | 101 | 100 |
| 2018-01-04 | 105 | 101.25 | 100 |
| 2018-01-03 | 106 | 101.5 | 100 |
| 2018-01-02 | 107 | 101.75 | 100 |
| 2018-01-01 | 108 | 102 | 100 |
| 2017-12-31 | 109 | 102.25 | 100 |
| 2017-12-30 | 110 | 102.5 | 100 |
| 2017-12-29 | 111 | 102.75 | 100 |
| 2017-12-28 | 112 | 103 | 100 |
| 2017-12-27 | 113 | 103.25 | 100 |
| 2017-12-26 | 114 | 103.5 | 100 |
| 2017-12-25 | 115 | 103.75 | 100 |
| 2017-12-24 | 116 | 104 | 100 |
| 2017-12-23 | 117 | 104.25 | 100 |
| 2017-12-22 | 118 | 104.5 | 100 |
| 2017-12-21 | 119 | 104.75 | 100 |
| 2017-12-20 | 120 | 105 | 100 |
| 2017-12-19 | 121 | 105.25 | 100 |
| 2017-12-18 | 122 | 105.5 | 100 |
| 2017-12-17 | 123 | 105.75 | 100 |
| 2017-12-16 | 124 | 106 | 100 |
| 2017-12-15 | 125 | 106.25 | 100 |
| 2017-12-14 | 126 | 106.5 | 100 |
| 2017-12-13 | 127 | 106.75 | 100 |
| 2017-12-12 | 128 | 107 | 100 |
| 2017-12-11 | 129 | 107.25 | 100 |
| 2017-12-10 | 130 | 107.5 | 100 |
| 2017-12-09 | 131 | 107.75 | 100 |
| 2017-12-08 | 132 | 108 | 100 |
| 2017-12-07 | 133 | 108.25 | 100 |
| 2017-12-06 | 134 | 108.5 | 100 |
| 2017-12-05 | 135 | 108.75 | 100 |
| 2017-12-04 | 136 | 109 | 100 |
| 2017-12-03 | 137 | 109.25 | 100 |
| 2017-12-02 | 138 | 109.5 | 100 |
| 2017-12-01 | 139 | 109.75 | 100 |
| 2017-11-30 | 140 | 110 | 100 |
| 2017-11-29 | 141 | 110.25 | 100 |
| 2017-11-28 | 142 | 110.5 | 100 |
| 2017-11-27 | 143 | 110.75 | 100 |
| 2017-11-26 | 144 | 111 | 100 |
| 2017-11-25 | 145 | 111.25 | 100 |
| 2017-11-24 | 146 | 111.5 | 100 |
| 2017-11-23 | 147 | 111.75 | 100 |
| 2017-11-22 | 148 | 112 | 100 |
| 2017-11-21 | 149 | 112.25 | 100 |
| 2017-11-20 | 150 | 112.5 | 100 |
| 2017-11-19 | 151 | 112.75 | 100 |
| 2017-11-18 | 152 | 113 | 100 |
| 2017-11-17 | 153 | 113.25 | 100 |
| 2017-11-16 | 154 | 113.5 | 100 |
| 2017-11-15 | 155 | 113.75 | 100 |
| 2017-11-14 | 156 | 114 | 100 |
| 2017-11-13 | 157 | 114.25 | 100 |
| 2017-11-12 | 158 | 114.5 | 100 |
| 2017-11-11 | 159 | 114.75 | 100 |
| 2017-11-10 | 160 | 115 | 100 |
| 2017-11-09 | 161 | 115.25 | 100 |
| 2017-11-08 | 162 | 115.5 | 100 |
| 2017-11-07 | 163 | 115.75 | 100 |
| 2017-11-06 | 164 | 116 | 100 |
| 2017-11-05 | 165 | 116.25 | 100 |
| 2017-11-04 | 166 | 116.5 | 100 |
| 2017-11-03 | 167 | 116.75 | 100 |
| 2017-11-02 | 168 | 117 | 100 |
| 2017-11-01 | 169 | 117.25 | 100 |
| 2017-10-31 | 170 | 117.5 | 100 |
| 2017-10-30 | 171 | 117.75 | 100 |
| 2017-10-29 | 172 | 118 | 100 |
| 2017-10-28 | 173 | 118.25 | 100 |
| 2017-10-27 | 174 | 118.5 | 100 |
| 2017-10-26 | 175 | 118.75 | 100 |
| 2017-10-25 | 176 | 119 | 100 |
| 2017-10-24 | 177 | 119.25 | 100 |
| 2017-10-23 | 178 | 119.5 | 100 |
| 2017-10-22 | 179 | 119.75 | 100 |
| 2017-10-21 | 180 | 120 | 100 |
| 2017-10-20 | 181 | 120.25 | 100 |
| 2017-10-19 | 182 | 120.5 | 100 |
| 2017-10-18 | 183 | 120.75 | 100 |
| 2017-10-17 | 184 | 121 | 100 |
| 2017-10-16 | 185 | 121.25 | 100 |
| 2017-10-15 | 186 | 121.5 | 100 |
| 2017-10-14 | 187 | 121.75 | 100 |
| 2017-10-13 | 188 | 122 | 100 |
| 2017-10-12 | 189 | 122.25 | 100 |
| 2017-10-11 | 190 | 122.5 | 100 |
| 2017-10-10 | 191 | 122.75 | 100 |
| 2017-10-09 | 192 | 123 | 100 |
| 2017-10-08 | 193 | 123.25 | 100 |
| 2017-10-07 | 194 | 123.5 | 100 |
| 2017-10-06 | 195 | 123.75 | 100 |
| 2017-10-05 | 196 | 124 | 100 |
| 2017-10-04 | 197 | 124.25 | 100 |
| 2017-10-03 | 198 | 124.5 | 100 |
| 2017-10-02 | 199 | 124.75 | 100 |
| 2017-10-01 | 200 | 125 | 100 |
| 2017-09-30 | 201 | 125.25 | 100 |
| 2017-09-29 | 202 | 125.5 | 100 |
| 2017-09-28 | 203 | 125.75 | 100 |
| 2017-09-27 | 204 | 126 | 100 |
| 2017-09-26 | 205 | 126.25 | 100 |
| 2017-09-25 | 206 | 126.5 | 100 |
| 2017-09-24 | 207 | 126.75 | 100 |
| 2017-09-23 | 208 | 127 | 100 |
| 2017-09-22 | 209 | 127.25 | 100 |
| 2017-09-21 | 210 | 127.5 | 100 |
| 2017-09-20 | 211 | 127.75 | 100 |
| 2017-09-19 | 212 | 128 | 100 |
| 2017-09-18 | 213 | 128.25 | 100 |
| 2017-09-17 | 214 | 128.5 | 100 |
| 2017-09-16 | 215 | 128.75 | 100 |
| 2017-09-15 | 216 | 129 | 100 |
| 2017-09-14 | 217 | 129.25 | 100 |
| 2017-09-13 | 218 | 129.5 | 100 |
| 2017-09-12 | 219 | 129.75 | 100 |
| 2017-09-11 | 220 | 130 | 100 |
| 2017-09-10 | 221 | 130.25 | 100 |
| 2017-09-09 | 222 | 130.5 | 100 |
| 2017-09-08 | 223 | 130.75 | 100 |
| 2017-09-07 | 224 | 131 | 100 |
| 2017-09-06 | 225 | 131.25 | 100 |
| 2017-09-05 | 226 | 131.5 | 100 |
| 2017-09-04 | 227 | 131.75 | 100 |
| 2017-09-03 | 228 | 132 | 100 |
| 2017-09-02 | 229 | 132.25 | 100 |
| 2017-09-01 | 230 | 132.5 | 100 |
| 2017-08-31 | 231 | 132.75 | 100 |
| 2017-08-30 | 232 | 133 | 100 |
| 2017-08-29 | 233 | 133.25 | 100 |
| 2017-08-28 | 234 | 133.5 | 100 |
| 2017-08-27 | 235 | 133.75 | 100 |
| 2017-08-26 | 236 | 134 | 100 |
| 2017-08-25 | 237 | 134.25 | 100 |
| 2017-08-24 | 238 | 134.5 | 100 |
| 2017-08-23 | 239 | 134.75 | 100 |
| 2017-08-22 | 240 | 135 | 100 |
| 2017-08-21 | 241 | 135.25 | 100 |
| 2017-08-20 | 242 | 135.5 | 100 |
| 2017-08-19 | 243 | 135.75 | 100 |
| 2017-08-18 | 244 | 136 | 100 |
| 2017-08-17 | 245 | 136.25 | 100 |
| 2017-08-16 | 246 | 136.5 | 100 |
| 2017-08-15 | 247 | 136.75 | 100 |
| 2017-08-14 | 248 | 137 | 100 |
| 2017-08-13 | 249 | 137.25 | 100 |
| 2017-08-12 | 250 | 137.5 | 100 |
| 2017-08-11 | 251 | 137.75 | 100 |
| 2017-08-10 | 252 | 138 | 100 |
| 2017-08-09 | 253 | 138.25 | 100 |
| 2017-08-08 | 254 | 138.5 | 100 |
| 2017-08-07 | 255 | 138.75 | 100 |
| 2017-08-06 | 256 | 139 | 100 |
| 2017-08-05 | 257 | 139.25 | 100 |
| 2017-08-04 | 258 | 139.5 | 100 |
| 2017-08-03 | 259 | 139.75 | 100 |
| 2017-08-02 | 260 | 140 | 100 |
| 2017-08-01 | 261 | 140.25 | 100 |
| 2017-07-31 | 262 | 140.5 | 100 |
| 2017-07-30 | 263 | 140.75 | 100 |
| 2017-07-29 | 264 | 141 | 100 |
| 2017-07-28 | 265 | 141.25 | 100 |
| 2017-07-27 | 266 | 141.5 | 100 |
| 2017-07-26 | 267 | 141.75 | 100 |
| 2017-07-25 | 268 | 142 | 100 |
| 2017-07-24 | 269 | 142.25 | 100 |
| 2017-07-23 | 270 | 142.5 | 100 |
| 2017-07-22 | 271 | 142.75 | 100 |
| 2017-07-21 | 272 | 143 | 100 |
| 2017-07-20 | 273 | 143.25 | 100 |
| 2017-07-19 | 274 | 143.5 | 100 |
| 2017-07-18 | 275 | 143.75 | 100 |
| 2017-07-17 | 276 | 144 | 100 |
| 2017-07-16 | 277 | 144.25 | 100 |
| 2017-07-15 | 278 | 144.5 | 100 |
| 2017-07-14 | 279 | 144.75 | 100 |
| 2017-07-13 | 280 | 145 | 100 |
| 2017-07-12 | 281 | 145.25 | 100 |
| 2017-07-11 | 282 | 145.5 | 100 |
| 2017-07-10 | 283 | 145.75 | 100 |
| 2017-07-09 | 284 | 146 | 100 |
| 2017-07-08 | 285 | 146.25 | 100 |
| 2017-07-07 | 286 | 146.5 | 100 |
| 2017-07-06 | 287 | 146.75 | 100 |
| 2017-07-05 | 288 | 147 | 100 |
| 2017-07-04 | 289 | 147.25 | 100 |
| 2017-07-03 | 290 | 147.5 | 100 |
| 2017-07-02 | 291 | 147.75 | 100 |
| 2017-07-01 | 292 | 148 | 100 |
| 2017-06-30 | 293 | 148.25 | 100 |
| 2017-06-29 | 294 | 148.5 | 100 |
| 2017-06-28 | 295 | 148.75 | 100 |
| 2017-06-27 | 296 | 149 | 100 |
| 2017-06-26 | 297 | 149.25 | 100 |
| 2017-06-25 | 298 | 149.5 | 100 |
| 2017-06-24 | 299 | 149.75 | 100 |
| 2017-06-23 | 300 | 150 | 100 |
| 2017-06-22 | 299 | 149.75 | 100 |
| 2017-06-21 | 298 | 149.5 | 100 |
| 2017-06-20 | 297 | 149.25 | 100 |
| 2017-06-19 | 296 | 149 | 100 |
| 2017-06-18 | 295 | 148.75 | 100 |
| 2017-06-17 | 294 | 148.5 | 100 |
| 2017-06-16 | 293 | 148.25 | 100 |
| 2017-06-15 | 292 | 148 | 100 |
| 2017-06-14 | 291 | 147.75 | 100 |
| 2017-06-13 | 290 | 147.5 | 100 |
| 2017-06-12 | 289 | 147.25 | 100 |
| 2017-06-11 | 288 | 147 | 100 |
| 2017-06-10 | 287 | 146.75 | 100 |
| 2017-06-09 | 286 | 146.5 | 100 |
| 2017-06-08 | 285 | 146.25 | 100 |
| 2017-06-07 | 284 | 146 | 100 |
| 2017-06-06 | 283 | 145.75 | 100 |
| 2017-06-05 | 282 | 145.5 | 100 |
| 2017-06-04 | 281 | 145.25 | 100 |
| 2017-06-03 | 280 | 145 | 100 |
| 2017-06-02 | 279 | 144.75 | 100 |
| 2017-06-01 | 278 | 144.5 | 100 |
| 2017-05-31 | 277 | 144.25 | 100 |
| 2017-05-30 | 276 | 144 | 100 |
| 2017-05-29 | 275 | 143.75 | 100 |
| 2017-05-28 | 274 | 143.5 | 100 |
| 2017-05-27 | 273 | 143.25 | 100 |
| 2017-05-26 | 272 | 143 | 100 |
| 2017-05-25 | 271 | 142.75 | 100 |
| 2017-05-24 | 270 | 142.5 | 100 |
| 2017-05-23 | 269 | 142.25 | 100 |
| 2017-05-22 | 268 | 142 | 100 |
| 2017-05-21 | 267 | 141.75 | 100 |
| 2017-05-20 | 266 | 141.5 | 100 |
| 2017-05-19 | 265 | 141.25 | 100 |
| 2017-05-18 | 264 | 141 | 100 |
| 2017-05-17 | 263 | 140.75 | 100 |
| 2017-05-16 | 262 | 140.5 | 100 |
| 2017-05-15 | 261 | 140.25 | 100 |
| 2017-05-14 | 260 | 140 | 100 |
| 2017-05-13 | 259 | 139.75 | 100 |
| 2017-05-12 | 258 | 139.5 | 100 |
| 2017-05-11 | 257 | 139.25 | 100 |
| 2017-05-10 | 256 | 139 | 100 |
| 2017-05-09 | 255 | 138.75 | 100 |
| 2017-05-08 | 254 | 138.5 | 100 |
| 2017-05-07 | 253 | 138.25 | 100 |
| 2017-05-06 | 252 | 138 | 100 |
| 2017-05-05 | 251 | 137.75 | 100 |
| 2017-05-04 | 250 | 137.5 | 100 |
| 2017-05-03 | 249 | 137.25 | 100 |
| 2017-05-02 | 248 | 137 | 100 |
| 2017-05-01 | 247 | 136.75 | 100 |
| 2017-04-30 | 246 | 136.5 | 100 |
| 2017-04-29 | 245 | 136.25 | 100 |
| 2017-04-28 | 244 | 136 | 100 |
| 2017-04-27 | 243 | 135.75 | 100 |
| 2017-04-26 | 242 | 135.5 | 100 |
| 2017-04-25 | 241 | 135.25 | 100 |
| 2017-04-24 | 240 | 135 | 100 |
| 2017-04-23 | 239 | 134.75 | 100 |
| 2017-04-22 | 238 | 134.5 | 100 |
| 2017-04-21 | 237 | 134.25 | 100 |
| 2017-04-20 | 236 | 134 | 100 |
| 2017-04-19 | 235 | 133.75 | 100 |
| 2017-04-18 | 234 | 133.5 | 100 |
| 2017-04-17 | 233 | 133.25 | 100 |
| 2017-04-16 | 232 | 133 | 100 |
| 2017-04-15 | 231 | 132.75 | 100 |
| 2017-04-14 | 230 | 132.5 | 100 |
| 2017-04-13 | 229 | 132.25 | 100 |
| 2017-04-12 | 228 | 132 | 100 |
| 2017-04-11 | 227 | 131.75 | 100 |
| 2017-04-10 | 226 | 131.5 | 100 |
| 2017-04-09 | 225 | 131.25 | 100 |
| 2017-04-08 | 224 | 131 | 100 |
| 2017-04-07 | 223 | 130.75 | 100 |
| 2017-04-06 | 222 | 130.5 | 100 |
| 2017-04-05 | 221 | 130.25 | 100 |
| 2017-04-04 | 220 | 130 | 100 |
| 2017-04-03 | 219 | 129.75 | 100 |
| 2017-04-02 | 218 | 129.5 | 100 |
| 2017-04-01 | 217 | 129.25 | 100 |
| 2017-03-31 | 216 | 129 | 100 |
| 2017-03-30 | 215 | 128.75 | 100 |
| 2017-03-29 | 214 | 128.5 | 100 |
| 2017-03-28 | 213 | 128.25 | 100 |
| 2017-03-27 | 212 | 128 | 100 |
| 2017-03-26 | 211 | 127.75 | 100 |
| 2017-03-25 | 210 | 127.5 | 100 |
| 2017-03-24 | 209 | 127.25 | 100 |
| 2017-03-23 | 208 | 127 | 100 |
| 2017-03-22 | 207 | 126.75 | 100 |
| 2017-03-21 | 206 | 126.5 | 100 |
| 2017-03-20 | 205 | 126.25 | 100 |
| 2017-03-19 | 204 | 126 | 100 |
| 2017-03-18 | 203 | 125.75 | 100 |
| 2017-03-17 | 202 | 125.5 | 100 |
| 2017-03-16 | 201 | 125.25 | 100 |
| 2017-03-15 | 200 | 125 | 100 |
| 2017-03-14 | 199 | 124.75 | 100 |
| 2017-03-13 | 198 | 124.5 | 100 |
| 2017-03-12 | 197 | 124.25 | 100 |
| 2017-03-11 | 196 | 124 | 100 |
| 2017-03-10 | 195 | 123.75 | 100 |
| 2017-03-09 | 194 | 123.5 | 100 |
| 2017-03-08 | 193 | 123.25 | 100 |
| 2017-03-07 | 192 | 123 | 100 |
| 2017-03-06 | 191 | 122.75 | 100 |
| 2017-03-05 | 190 | 122.5 | 100 |
| 2017-03-04 | 189 | 122.25 | 100 |
| 2017-03-03 | 188 | 122 | 100 |
| 2017-03-02 | 187 | 121.75 | 100 |
| 2017-03-01 | 186 | 121.5 | 100 |
| 2017-02-28 | 185 | 121.25 | 100 |
| 2017-02-27 | 184 | 121 | 100 |
| 2017-02-26 | 183 | 120.75 | 100 |
| 2017-02-25 | 182 | 120.5 | 100 |
| 2017-02-24 | 181 | 120.25 | 100 |
| 2017-02-23 | 180 | 120 | 100 |
| 2017-02-22 | 179 | 119.75 | 100 |
| 2017-02-21 | 178 | 119.5 | 100 |
| 2017-02-20 | 177 | 119.25 | 100 |
| 2017-02-19 | 176 | 119 | 100 |
| 2017-02-18 | 175 | 118.75 | 100 |
| 2017-02-17 | 174 | 118.5 | 100 |
| 2017-02-16 | 173 | 118.25 | 100 |
| 2017-02-15 | 172 | 118 | 100 |
| 2017-02-14 | 171 | 117.75 | 100 |
| 2017-02-13 | 170 | 117.5 | 100 |
| 2017-02-12 | 169 | 117.25 | 100 |
| 2017-02-11 | 168 | 117 | 100 |
| 2017-02-10 | 167 | 116.75 | 100 |
| 2017-02-09 | 166 | 116.5 | 100 |
| 2017-02-08 | 165 | 116.25 | 100 |
| 2017-02-07 | 164 | 116 | 100 |
| 2017-02-06 | 163 | 115.75 | 100 |
| 2017-02-05 | 162 | 115.5 | 100 |
| 2017-02-04 | 161 | 115.25 | 100 |
| 2017-02-03 | 160 | 115 | 100 |
| 2017-02-02 | 159 | 114.75 | 100 |
| 2017-02-01 | 158 | 114.5 | 100 |
| 2017-01-31 | 157 | 114.25 | 100 |
| 2017-01-30 | 156 | 114 | 100 |
| 2017-01-29 | 155 | 113.75 | 100 |
| 2017-01-28 | 154 | 113.5 | 100 |
| 2017-01-27 | 153 | 113.25 | 100 |
| 2017-01-26 | 152 | 113 | 100 |
| 2017-01-25 | 151 | 112.75 | 100 |
| 2017-01-24 | 150 | 112.5 | 100 |
| 2017-01-23 | 149 | 112.25 | 100 |
| 2017-01-22 | 148 | 112 | 100 |
| 2017-01-21 | 147 | 111.75 | 100 |
| 2017-01-20 | 146 | 111.5 | 100 |
| 2017-01-19 | 145 | 111.25 | 100 |
| 2017-01-18 | 144 | 111 | 100 |
| 2017-01-17 | 143 | 110.75 | 100 |
| 2017-01-16 | 142 | 110.5 | 100 |
| 2017-01-15 | 141 | 110.25 | 100 |
| 2017-01-14 | 140 | 110 | 100 |
| 2017-01-13 | 139 | 109.75 | 100 |
| 2017-01-12 | 138 | 109.5 | 100 |
| 2017-01-11 | 137 | 109.25 | 100 |
| 2017-01-10 | 136 | 109 | 100 |
| 2017-01-09 | 135 | 108.75 | 100 |
| 2017-01-08 | 134 | 108.5 | 100 |
| 2017-01-07 | 133 | 108.25 | 100 |
| 2017-01-06 | 132 | 108 | 100 |
| 2017-01-05 | 131 | 107.75 | 100 |
| 2017-01-04 | 130 | 107.5 | 100 |
| 2017-01-03 | 131 | 107.75 | 100 |
| 2017-01-02 | 132 | 108 | 100 |
| 2017-01-01 | 133 | 108.25 | 100 |
| 2016-12-31 | 134 | 108.5 | 100 |
| 2016-12-30 | 135 | 108.75 | 100 |
| 2016-12-29 | 136 | 109 | 100 |
| 2016-12-28 | 137 | 109.25 | 100 |
| 2016-12-27 | 138 | 109.5 | 100 |
| 2016-12-26 | 139 | 109.75 | 100 |
| 2016-12-25 | 140 | 110 | 100 |
| 2016-12-24 | 141 | 110.25 | 100 |
| 2016-12-23 | 142 | 110.5 | 100 |
| 2016-12-22 | 143 | 110.75 | 100 |
| 2016-12-21 | 144 | 111 | 100 |
| 2016-12-20 | 145 | 111.25 | 100 |
| 2016-12-19 | 146 | 111.5 | 100 |
| 2016-12-18 | 147 | 111.75 | 100 |
| 2016-12-17 | 148 | 112 | 100 |
| 2016-12-16 | 149 | 112.25 | 100 |
| 2016-12-15 | 150 | 112.5 | 100 |
| 2016-12-14 | 151 | 112.75 | 100 |
| 2016-12-13 | 152 | 113 | 100 |
| 2016-12-12 | 153 | 113.25 | 100 |
| 2016-12-11 | 154 | 113.5 | 100 |
| 2016-12-10 | 155 | 113.75 | 100 |
| 2016-12-09 | 156 | 114 | 100 |
| 2016-12-08 | 157 | 114.25 | 100 |
| 2016-12-07 | 158 | 114.5 | 100 |
| 2016-12-06 | 159 | 114.75 | 100 |
| 2016-12-05 | 160 | 115 | 100 |
| 2016-12-04 | 161 | 115.25 | 100 |
| 2016-12-03 | 162 | 115.5 | 100 |
| 2016-12-02 | 163 | 115.75 | 100 |
| 2016-12-01 | 164 | 116 | 100 |
| 2016-11-30 | 165 | 116.25 | 100 |
| 2016-11-29 | 166 | 116.5 | 100 |
| 2016-11-28 | 167 | 116.75 | 100 |
| 2016-11-27 | 168 | 117 | 100 |
| 2016-11-26 | 169 | 117.25 | 100 |
| 2016-11-25 | 170 | 117.5 | 100 |
| 2016-11-24 | 171 | 117.75 | 100 |
| 2016-11-23 | 172 | 118 | 100 |
| 2016-11-22 | 173 | 118.25 | 100 |
| 2016-11-21 | 174 | 118.5 | 100 |
| 2016-11-20 | 175 | 118.75 | 100 |
| 2016-11-19 | 176 | 119 | 100 |
| 2016-11-18 | 177 | 119.25 | 100 |
| 2016-11-17 | 178 | 119.5 | 100 |
| 2016-11-16 | 179 | 119.75 | 100 |
| 2016-11-15 | 180 | 120 | 100 |
| 2016-11-14 | 181 | 120.25 | 100 |
| 2016-11-13 | 182 | 120.5 | 100 |
| 2016-11-12 | 183 | 120.75 | 100 |
| 2016-11-11 | 184 | 121 | 100 |
| 2016-11-10 | 185 | 121.25 | 100 |
| 2016-11-09 | 186 | 121.5 | 100 |
| 2016-11-08 | 187 | 121.75 | 100 |
| 2016-11-07 | 188 | 122 | 100 |
| 2016-11-06 | 189 | 122.25 | 100 |
| 2016-11-05 | 190 | 122.5 | 100 |
| 2016-11-04 | 191 | 122.75 | 100 |
| 2016-11-03 | 192 | 123 | 100 |
| 2016-11-02 | 193 | 123.25 | 100 |
| 2016-11-01 | 194 | 123.5 | 100 |
| 2016-10-31 | 195 | 123.75 | 100 |
| 2016-10-30 | 196 | 124 | 100 |
| 2016-10-29 | 197 | 124.25 | 100 |
| 2016-10-28 | 198 | 124.5 | 100 |
| 2016-10-27 | 199 | 124.75 | 100 |
| 2016-10-26 | 200 | 125 | 100 |
| 2016-10-25 | 201 | 125.25 | 100 |
| 2016-10-24 | 202 | 125.5 | 100 |
| 2016-10-23 | 203 | 125.75 | 100 |
| 2016-10-22 | 204 | 126 | 100 |
| 2016-10-21 | 205 | 126.25 | 100 |
| 2016-10-20 | 206 | 126.5 | 100 |
| 2016-10-19 | 207 | 126.75 | 100 |
| 2016-10-18 | 208 | 127 | 100 |
| 2016-10-17 | 209 | 127.25 | 100 |
| 2016-10-16 | 210 | 127.5 | 100 |
| 2016-10-15 | 211 | 127.75 | 100 |
| 2016-10-14 | 212 | 128 | 100 |
| 2016-10-13 | 213 | 128.25 | 100 |
| 2016-10-12 | 214 | 128.5 | 100 |
| 2016-10-11 | 215 | 128.75 | 100 |
| 2016-10-10 | 216 | 129 | 100 |
| 2016-10-09 | 217 | 129.25 | 100 |
| 2016-10-08 | 218 | 129.5 | 100 |
| 2016-10-07 | 219 | 129.75 | 100 |
| 2016-10-06 | 220 | 130 | 100 |
| 2016-10-05 | 221 | 130.25 | 100 |
| 2016-10-04 | 222 | 130.5 | 100 |
| 2016-10-03 | 223 | 130.75 | 100 |
| 2016-10-02 | 224 | 131 | 100 |
| 2016-10-01 | 225 | 131.25 | 100 |
| 2016-09-30 | 226 | 131.5 | 100 |
| 2016-09-29 | 227 | 131.75 | 100 |
| 2016-09-28 | 228 | 132 | 100 |
| 2016-09-27 | 229 | 132.25 | 100 |
| 2016-09-26 | 230 | 132.5 | 100 |
| 2016-09-25 | 231 | 132.75 | 100 |
| 2016-09-24 | 232 | 133 | 100 |
| 2016-09-23 | 233 | 133.25 | 100 |
| 2016-09-22 | 234 | 133.5 | 100 |
| 2016-09-21 | 235 | 133.75 | 100 |
| 2016-09-20 | 236 | 134 | 100 |
| 2016-09-19 | 237 | 134.25 | 100 |
| 2016-09-18 | 238 | 134.5 | 100 |
| 2016-09-17 | 239 | 134.75 | 100 |
| 2016-09-16 | 240 | 135 | 100 |
| 2016-09-15 | 241 | 135.25 | 100 |
| 2016-09-14 | 242 | 135.5 | 100 |
| 2016-09-13 | 243 | 135.75 | 100 |
| 2016-09-12 | 244 | 136 | 100 |
| 2016-09-11 | 245 | 136.25 | 100 |
| 2016-09-10 | 246 | 136.5 | 100 |
| 2016-09-09 | 247 | 136.75 | 100 |
| 2016-09-08 | 248 | 137 | 100 |
| 2016-09-07 | 249 | 137.25 | 100 |
| 2016-09-06 | 250 | 137.5 | 100 |
| 2016-09-05 | 251 | 137.75 | 100 |
| 2016-09-04 | 252 | 138 | 100 |
| 2016-09-03 | 253 | 138.25 | 100 |
| 2016-09-02 | 254 | 138.5 | 100 |
| 2016-09-01 | 255 | 138.75 | 100 |
| 2016-08-31 | 256 | 139 | 100 |
| 2016-08-30 | 257 | 139.25 | 100 |
| 2016-08-29 | 258 | 139.5 | 100 |
| 2016-08-28 | 259 | 139.75 | 100 |
| 2016-08-27 | 260 | 140 | 100 |
| 2016-08-26 | 261 | 140.25 | 100 |
| 2016-08-25 | 262 | 140.5 | 100 |
| 2016-08-24 | 263 | 140.75 | 100 |
| 2016-08-23 | 264 | 141 | 100 |
| 2016-08-22 | 265 | 141.25 | 100 |
| 2016-08-21 | 266 | 141.5 | 100 |
| 2016-08-20 | 267 | 141.75 | 100 |
| 2016-08-19 | 268 | 142 | 100 |
| 2016-08-18 | 269 | 142.25 | 100 |
| 2016-08-17 | 270 | 142.5 | 100 |
| 2016-08-16 | 271 | 142.75 | 100 |
| 2016-08-15 | 272 | 143 | 100 |
| 2016-08-14 | 273 | 143.25 | 100 |
| 2016-08-13 | 274 | 143.5 | 100 |
| 2016-08-12 | 275 | 143.75 | 100 |
| 2016-08-11 | 276 | 144 | 100 |
| 2016-08-10 | 277 | 144.25 | 100 |
| 2016-08-09 | 278 | 144.5 | 100 |
| 2016-08-08 | 279 | 144.75 | 100 |
| 2016-08-07 | 280 | 145 | 100 |
| 2016-08-06 | 281 | 145.25 | 100 |
| 2016-08-05 | 282 | 145.5 | 100 |
| 2016-08-04 | 283 | 145.75 | 100 |
| 2016-08-03 | 284 | 146 | 100 |
| 2016-08-02 | 285 | 146.25 | 100 |
| 2016-08-01 | 286 | 146.5 | 100 |
| 2016-07-31 | 287 | 146.75 | 100 |
| 2016-07-30 | 288 | 147 | 100 |
| 2016-07-29 | 289 | 147.25 | 100 |
| 2016-07-28 | 290 | 147.5 | 100 |
| 2016-07-27 | 291 | 147.75 | 100 |
| 2016-07-26 | 292 | 148 | 100 |
| 2016-07-25 | 293 | 148.25 | 100 |
| 2016-07-24 | 294 | 148.5 | 100 |
| 2016-07-23 | 295 | 148.75 | 100 |
| 2016-07-22 | 296 | 149 | 100 |
| 2016-07-21 | 297 | 149.25 | 100 |
| 2016-07-20 | 298 | 149.5 | 100 |
| 2016-07-19 | 299 | 149.75 | 100 |
| 2016-07-18 | 300 | 150 | 100 |
| 2016-07-17 | 299 | 149.75 | 100 |
| 2016-07-16 | 298 | 149.5 | 100 |
| 2016-07-15 | 297 | 149.25 | 100 |
| 2016-07-14 | 296 | 149 | 100 |
| 2016-07-13 | 295 | 148.75 | 100 |
| 2016-07-12 | 294 | 148.5 | 100 |
| 2016-07-11 | 293 | 148.25 | 100 |
| 2016-07-10 | 292 | 148 | 100 |
| 2016-07-09 | 291 | 147.75 | 100 |
| 2016-07-08 | 290 | 147.5 | 100 |
| 2016-07-07 | 289 | 147.25 | 100 |
| 2016-07-06 | 288 | 147 | 100 |
| 2016-07-05 | 287 | 146.75 | 100 |
| 2016-07-04 | 286 | 146.5 | 100 |
| 2016-07-03 | 285 | 146.25 | 100 |
| 2016-07-02 | 284 | 146 | 100 |
| 2016-07-01 | 283 | 145.75 | 100 |
| 2016-06-30 | 282 | 145.5 | 100 |
| 2016-06-29 | 281 | 145.25 | 100 |
| 2016-06-28 | 280 | 145 | 100 |
| 2016-06-27 | 279 | 144.75 | 100 |
| 2016-06-26 | 278 | 144.5 | 100 |
| 2016-06-25 | 277 | 144.25 | 100 |
| 2016-06-24 | 276 | 144 | 100 |
| 2016-06-23 | 275 | 143.75 | 100 |
| 2016-06-22 | 274 | 143.5 | 100 |
| 2016-06-21 | 273 | 143.25 | 100 |
| 2016-06-20 | 272 | 143 | 100 |
| 2016-06-19 | 271 | 142.75 | 100 |
| 2016-06-18 | 270 | 142.5 | 100 |
| 2016-06-17 | 269 | 142.25 | 100 |
| 2016-06-16 | 268 | 142 | 100 |
| 2016-06-15 | 267 | 141.75 | 100 |
| 2016-06-14 | 266 | 141.5 | 100 |
| 2016-06-13 | 265 | 141.25 | 100 |
| 2016-06-12 | 264 | 141 | 100 |
| 2016-06-11 | 263 | 140.75 | 100 |
| 2016-06-10 | 262 | 140.5 | 100 |
| 2016-06-09 | 261 | 140.25 | 100 |
| 2016-06-08 | 260 | 140 | 100 |
| 2016-06-07 | 259 | 139.75 | 100 |
| 2016-06-06 | 258 | 139.5 | 100 |
| 2016-06-05 | 257 | 139.25 | 100 |
| 2016-06-04 | 256 | 139 | 100 |
| 2016-06-03 | 255 | 138.75 | 100 |
| 2016-06-02 | 254 | 138.5 | 100 |
| 2016-06-01 | 253 | 138.25 | 100 |
| 2016-05-31 | 252 | 138 | 100 |
| 2016-05-30 | 251 | 137.75 | 100 |
| 2016-05-29 | 250 | 137.5 | 100 |
| 2016-05-28 | 249 | 137.25 | 100 |
| 2016-05-27 | 248 | 137 | 100 |
| 2016-05-26 | 247 | 136.75 | 100 |
| 2016-05-25 | 246 | 136.5 | 100 |
| 2016-05-24 | 245 | 136.25 | 100 |
| 2016-05-23 | 244 | 136 | 100 |
| 2016-05-22 | 243 | 135.75 | 100 |
| 2016-05-21 | 242 | 135.5 | 100 |
| 2016-05-20 | 241 | 135.25 | 100 |
| 2016-05-19 | 240 | 135 | 100 |
| 2016-05-18 | 239 | 134.75 | 100 |
| 2016-05-17 | 238 | 134.5 | 100 |
| 2016-05-16 | 237 | 134.25 | 100 |
| 2016-05-15 | 236 | 134 | 100 |
| 2016-05-14 | 235 | 133.75 | 100 |
| 2016-05-13 | 234 | 133.5 | 100 |
| 2016-05-12 | 233 | 133.25 | 100 |
| 2016-05-11 | 232 | 133 | 100 |
| 2016-05-10 | 231 | 132.75 | 100 |
| 2016-05-09 | 230 | 132.5 | 100 |
| 2016-05-08 | 229 | 132.25 | 100 |
| 2016-05-07 | 228 | 132 | 100 |
| 2016-05-06 | 227 | 131.75 | 100 |
| 2016-05-05 | 226 | 131.5 | 100 |
| 2016-05-04 | 225 | 131.25 | 100 |
| 2016-05-03 | 224 | 131 | 100 |
| 2016-05-02 | 223 | 130.75 | 100 |
| 2016-05-01 | 222 | 130.5 | 100 |
| 2016-04-30 | 221 | 130.25 | 100 |
| 2016-04-29 | 220 | 130 | 100 |
| 2016-04-28 | 219 | 129.75 | 100 |
| 2016-04-27 | 218 | 129.5 | 100 |
| 2016-04-26 | 217 | 129.25 | 100 |
| 2016-04-25 | 216 | 129 | 100 |
| 2016-04-24 | 215 | 128.75 | 100 |
| 2016-04-23 | 214 | 128.5 | 100 |
| 2016-04-22 | 213 | 128.25 | 100 |
| 2016-04-21 | 212 | 128 | 100 |
| 2016-04-20 | 211 | 127.75 | 100 |
| 2016-04-19 | 210 | 127.5 | 100 |
| 2016-04-18 | 209 | 127.25 | 100 |
| 2016-04-17 | 208 | 127 | 100 |
| 2016-04-16 | 207 | 126.75 | 100 |
| 2016-04-15 | 206 | 126.5 | 100 |
| 2016-04-14 | 205 | 126.25 | 100 |
| 2016-04-13 | 204 | 126 | 100 |
| 2016-04-12 | 203 | 125.75 | 100 |
| 2016-04-11 | 202 | 125.5 | 100 |
| 2016-04-10 | 201 | 125.25 | 100 |
| 2016-04-09 | 200 | 125 | 100 |
| 2016-04-08 | 199 | 124.75 | 100 |
| 2016-04-07 | 198 | 124.5 | 100 |
| 2016-04-06 | 197 | 124.25 | 100 |
| 2016-04-05 | 196 | 124 | 100 |
| 2016-04-04 | 195 | 123.75 | 100 |
| 2016-04-03 | 194 | 123.5 | 100 |
| 2016-04-02 | 193 | 123.25 | 100 |
| 2016-04-01 | 192 | 123 | 100 |
| 2016-03-31 | 191 | 122.75 | 100 |
| 2016-03-30 | 190 | 122.5 | 100 |
| 2016-03-29 | 189 | 122.25 | 100 |
| 2016-03-28 | 188 | 122 | 100 |
| 2016-03-27 | 187 | 121.75 | 100 |
| 2016-03-26 | 186 | 121.5 | 100 |
| 2016-03-25 | 185 | 121.25 | 100 |
| 2016-03-24 | 184 | 121 | 100 |
| 2016-03-23 | 183 | 120.75 | 100 |
| 2016-03-22 | 182 | 120.5 | 100 |
| 2016-03-21 | 181 | 120.25 | 100 |
| 2016-03-20 | 180 | 120 | 100 |
| 2016-03-19 | 179 | 119.75 | 100 |
| 2016-03-18 | 178 | 119.5 | 100 |
| 2016-03-17 | 177 | 119.25 | 100 |
| 2016-03-16 | 176 | 119 | 100 |
| 2016-03-15 | 175 | 118.75 | 100 |
| 2016-03-14 | 174 | 118.5 | 100 |
| 2016-03-13 | 173 | 118.25 | 100 |
| 2016-03-12 | 172 | 118 | 100 |
| 2016-03-11 | 171 | 117.75 | 100 |
| 2016-03-10 | 170 | 117.5 | 100 |
| 2016-03-09 | 169 | 117.25 | 100 |
| 2016-03-08 | 168 | 117 | 100 |
| 2016-03-07 | 167 | 116.75 | 100 |
| 2016-03-06 | 166 | 116.5 | 100 |
| 2016-03-05 | 165 | 116.25 | 100 |
| 2016-03-04 | 164 | 116 | 100 |
| 2016-03-03 | 163 | 115.75 | 100 |
| 2016-03-02 | 162 | 115.5 | 100 |
| 2016-03-01 | 161 | 115.25 | 100 |
| 2016-02-29 | 160 | 115 | 100 |
| 2016-02-28 | 159 | 114.75 | 100 |
| 2016-02-27 | 158 | 114.5 | 100 |
| 2016-02-26 | 157 | 114.25 | 100 |
| 2016-02-25 | 156 | 114 | 100 |
| 2016-02-24 | 155 | 113.75 | 100 |
| 2016-02-23 | 154 | 113.5 | 100 |
| 2016-02-22 | 153 | 113.25 | 100 |
| 2016-02-21 | 152 | 113 | 100 |
| 2016-02-20 | 151 | 112.75 | 100 |
| 2016-02-19 | 150 | 112.5 | 100 |
| 2016-02-18 | 149 | 112.25 | 100 |
| 2016-02-17 | 148 | 112 | 100 |
| 2016-02-16 | 147 | 111.75 | 100 |
| 2016-02-15 | 146 | 111.5 | 100 |
| 2016-02-14 | 145 | 111.25 | 100 |
| 2016-02-13 | 144 | 111 | 100 |
| 2016-02-12 | 143 | 110.75 | 100 |
| 2016-02-11 | 142 | 110.5 | 100 |
| 2016-02-10 | 141 | 110.25 | 100 |
| 2016-02-09 | 140 | 110 | 100 |
| 2016-02-08 | 139 | 109.75 | 100 |
| 2016-02-07 | 138 | 109.5 | 100 |
| 2016-02-06 | 137 | 109.25 | 100 |
| 2016-02-05 | 136 | 109 | 100 |
| 2016-02-04 | 135 | 108.75 | 100 |
| 2016-02-03 | 134 | 108.5 | 100 |
| 2016-02-02 | 133 | 108.25 | 100 |
| 2016-02-01 | 132 | 108 | 100 |
| 2016-01-31 | 131 | 107.75 | 100 |
| 2016-01-30 | 130 | 107.5 | 100 |
| 2016-01-29 | 129 | 107.25 | 100 |
| 2016-01-28 | 128 | 107 | 100 |
| 2016-01-27 | 127 | 106.75 | 100 |
| 2016-01-26 | 126 | 106.5 | 100 |
| 2016-01-25 | 125 | 106.25 | 100 |
| 2016-01-24 | 124 | 106 | 100 |
| 2016-01-23 | 123 | 105.75 | 100 |
| 2016-01-22 | 122 | 105.5 | 100 |
| 2016-01-21 | 121 | 105.25 | 100 |
| 2016-01-20 | 120 | 105 | 100 |
| 2016-01-19 | 119 | 104.75 | 100 |
| 2016-01-18 | 118 | 104.5 | 100 |
| 2016-01-17 | 117 | 104.25 | 100 |
| 2016-01-16 | 116 | 104 | 100 |
| 2016-01-15 | 115 | 103.75 | 100 |
| 2016-01-14 | 114 | 103.5 | 100 |
| 2016-01-13 | 113 | 103.25 | 100 |
| 2016-01-12 | 112 | 103 | 100 |
| 2016-01-11 | 111 | 102.75 | 100 |
| 2016-01-10 | 110 | 102.5 | 100 |
| 2016-01-09 | 109 | 102.25 | 100 |
| 2016-01-08 | 108 | 102 | 100 |
| 2016-01-07 | 107 | 101.75 | 100 |
| 2016-01-06 | 106 | 101.5 | 100 |
| 2016-01-05 | 105 | 101.25 | 100 |
| 2016-01-04 | 104 | 101 | 100 |
| 2016-01-03 | 103 | 100.75 | 100 |
| 2016-01-02 | 102 | 100.5 | 100 |
| 2016-01-01 | 101 | 100.25 | 100 |
| 2015-12-31 | 100 | 100 | 100 |